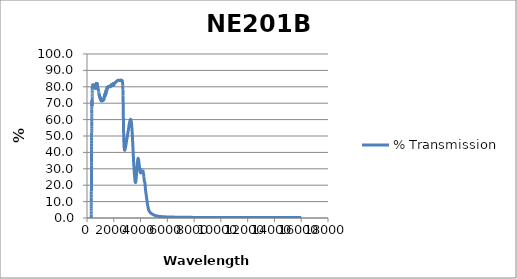
| Category | % Transmission |
|---|---|
| 200.0 | 0.026 |
| 201.0 | 0.026 |
| 202.0 | 0.025 |
| 203.0 | 0.025 |
| 204.0 | 0.025 |
| 205.0 | 0.024 |
| 206.0 | 0.024 |
| 207.0 | 0.024 |
| 208.0 | 0.023 |
| 209.0 | 0.023 |
| 210.0 | 0.023 |
| 211.0 | 0.022 |
| 212.0 | 0.022 |
| 213.0 | 0.022 |
| 214.0 | 0.022 |
| 215.0 | 0.021 |
| 216.0 | 0.021 |
| 217.0 | 0.021 |
| 218.0 | 0.02 |
| 219.0 | 0.02 |
| 220.0 | 0.02 |
| 221.0 | 0.02 |
| 222.0 | 0.02 |
| 223.0 | 0.019 |
| 224.0 | 0.019 |
| 225.0 | 0.019 |
| 226.0 | 0.019 |
| 227.0 | 0.019 |
| 228.0 | 0.018 |
| 229.0 | 0.018 |
| 230.0 | 0.018 |
| 231.0 | 0.018 |
| 232.0 | 0.018 |
| 233.0 | 0.017 |
| 234.0 | 0.017 |
| 235.0 | 0.017 |
| 236.0 | 0.017 |
| 237.0 | 0.017 |
| 238.0 | 0.017 |
| 239.0 | 0.017 |
| 240.0 | 0.016 |
| 241.0 | 0.016 |
| 242.0 | 0.016 |
| 243.0 | 0.016 |
| 244.0 | 0.016 |
| 245.0 | 0.016 |
| 246.0 | 0.015 |
| 247.0 | 0.015 |
| 248.0 | 0.015 |
| 249.0 | 0.015 |
| 250.0 | 0.015 |
| 251.0 | 0.015 |
| 252.0 | 0.015 |
| 253.0 | 0.015 |
| 254.0 | 0.015 |
| 255.0 | 0.015 |
| 256.0 | 0.014 |
| 257.0 | 0.014 |
| 258.0 | 0.014 |
| 259.0 | 0.014 |
| 260.0 | 0.014 |
| 261.0 | 0.014 |
| 262.0 | 0.014 |
| 263.0 | 0.014 |
| 264.0 | 0.014 |
| 265.0 | 0.013 |
| 266.0 | 0.013 |
| 267.0 | 0.013 |
| 268.0 | 0.013 |
| 269.0 | 0.013 |
| 270.0 | 0.013 |
| 271.0 | 0.013 |
| 272.0 | 0.013 |
| 273.0 | 0.013 |
| 274.0 | 0.013 |
| 275.0 | 0.013 |
| 276.0 | 0.013 |
| 277.0 | 0.012 |
| 278.0 | 0.012 |
| 279.0 | 0.012 |
| 280.0 | 0.012 |
| 281.0 | 0.012 |
| 282.0 | 0.012 |
| 283.0 | 0.012 |
| 284.0 | 0.012 |
| 285.0 | 0.012 |
| 286.0 | 0.012 |
| 287.0 | 0.012 |
| 288.0 | 0.012 |
| 289.0 | 0.012 |
| 290.0 | 0.012 |
| 291.0 | 0.012 |
| 292.0 | 0.012 |
| 293.0 | 0.012 |
| 294.0 | 0.011 |
| 295.0 | 0.011 |
| 296.0 | 0.011 |
| 297.0 | 0.011 |
| 298.0 | 0.011 |
| 299.0 | 0.011 |
| 300.0 | 0.012 |
| 301.0 | 0.013 |
| 302.0 | 0.015 |
| 303.0 | 0.018 |
| 304.0 | 0.025 |
| 305.0 | 0.037 |
| 306.0 | 0.057 |
| 307.0 | 0.091 |
| 308.0 | 0.143 |
| 309.0 | 0.223 |
| 310.0 | 0.336 |
| 311.0 | 0.491 |
| 312.0 | 0.7 |
| 313.0 | 0.976 |
| 314.0 | 1.33 |
| 315.0 | 1.773 |
| 316.0 | 2.313 |
| 317.0 | 2.958 |
| 318.0 | 3.737 |
| 319.0 | 4.62 |
| 320.0 | 5.663 |
| 321.0 | 6.838 |
| 322.0 | 8.12 |
| 323.0 | 9.443 |
| 324.0 | 10.932 |
| 325.0 | 12.541 |
| 326.0 | 14.221 |
| 327.0 | 16.132 |
| 328.0 | 18.039 |
| 329.0 | 19.902 |
| 330.0 | 21.915 |
| 331.0 | 23.95 |
| 332.0 | 25.98 |
| 333.0 | 28.074 |
| 334.0 | 30.086 |
| 335.0 | 31.977 |
| 336.0 | 34.009 |
| 337.0 | 36.053 |
| 338.0 | 38.083 |
| 339.0 | 40.099 |
| 340.0 | 41.965 |
| 341.0 | 43.652 |
| 342.0 | 45.519 |
| 343.0 | 47.139 |
| 344.0 | 48.872 |
| 345.0 | 50.507 |
| 346.0 | 52.075 |
| 347.0 | 53.195 |
| 348.0 | 54.621 |
| 349.0 | 55.927 |
| 350.0 | 57.354 |
| 351.0 | 58.929 |
| 352.0 | 60.141 |
| 353.0 | 60.822 |
| 354.0 | 61.939 |
| 355.0 | 62.888 |
| 356.0 | 63.934 |
| 357.0 | 65.194 |
| 358.0 | 66.045 |
| 359.0 | 66.394 |
| 360.0 | 67.285 |
| 361.0 | 67.878 |
| 362.0 | 68.768 |
| 363.0 | 69.699 |
| 364.0 | 70.159 |
| 365.0 | 70.385 |
| 366.0 | 70.913 |
| 367.0 | 71.13 |
| 368.0 | 71.334 |
| 369.0 | 71.805 |
| 370.0 | 71.624 |
| 371.0 | 71.184 |
| 372.0 | 70.802 |
| 373.0 | 70.293 |
| 374.0 | 69.778 |
| 375.0 | 69.516 |
| 376.0 | 68.966 |
| 377.0 | 68.211 |
| 378.0 | 68.582 |
| 379.0 | 68.857 |
| 380.0 | 69.592 |
| 381.0 | 70.03 |
| 382.0 | 70.917 |
| 383.0 | 71.751 |
| 384.0 | 73.28 |
| 385.0 | 74.082 |
| 386.0 | 74.896 |
| 387.0 | 75.22 |
| 388.0 | 75.907 |
| 389.0 | 76.566 |
| 390.0 | 77.515 |
| 391.0 | 77.802 |
| 392.0 | 78.208 |
| 393.0 | 78.088 |
| 394.0 | 78.36 |
| 395.0 | 78.755 |
| 396.0 | 79.539 |
| 397.0 | 79.653 |
| 398.0 | 79.826 |
| 399.0 | 79.42 |
| 400.0 | 79.364 |
| 401.0 | 79.413 |
| 402.0 | 79.918 |
| 403.0 | 79.884 |
| 404.0 | 79.94 |
| 405.0 | 79.471 |
| 406.0 | 79.562 |
| 407.0 | 79.337 |
| 408.0 | 79.728 |
| 409.0 | 79.87 |
| 410.0 | 79.665 |
| 411.0 | 79.064 |
| 412.0 | 79.087 |
| 413.0 | 79.194 |
| 414.0 | 79.439 |
| 415.0 | 79.461 |
| 416.0 | 79.37 |
| 417.0 | 78.981 |
| 418.0 | 79.154 |
| 419.0 | 79.397 |
| 420.0 | 79.717 |
| 421.0 | 79.979 |
| 422.0 | 79.78 |
| 423.0 | 79.433 |
| 424.0 | 79.553 |
| 425.0 | 79.748 |
| 426.0 | 80.093 |
| 427.0 | 80.285 |
| 428.0 | 80.211 |
| 429.0 | 79.819 |
| 430.0 | 79.826 |
| 431.0 | 79.998 |
| 432.0 | 80.255 |
| 433.0 | 80.154 |
| 434.0 | 80.075 |
| 435.0 | 79.835 |
| 436.0 | 79.821 |
| 437.0 | 79.872 |
| 438.0 | 80.129 |
| 439.0 | 80.277 |
| 440.0 | 80.16 |
| 441.0 | 79.695 |
| 442.0 | 79.713 |
| 443.0 | 79.818 |
| 444.0 | 80.124 |
| 445.0 | 80.496 |
| 446.0 | 80.363 |
| 447.0 | 80.042 |
| 448.0 | 80.134 |
| 449.0 | 80.308 |
| 450.0 | 80.776 |
| 451.0 | 81.149 |
| 452.0 | 80.925 |
| 453.0 | 80.6 |
| 454.0 | 80.743 |
| 455.0 | 80.925 |
| 456.0 | 81.27 |
| 457.0 | 81.545 |
| 458.0 | 81.417 |
| 459.0 | 81.044 |
| 460.0 | 81.016 |
| 461.0 | 81.171 |
| 462.0 | 81.552 |
| 463.0 | 81.818 |
| 464.0 | 81.482 |
| 465.0 | 81.108 |
| 466.0 | 81.163 |
| 467.0 | 81.009 |
| 468.0 | 81.349 |
| 469.0 | 81.9 |
| 470.0 | 81.507 |
| 471.0 | 80.947 |
| 472.0 | 80.905 |
| 473.0 | 80.803 |
| 474.0 | 81.149 |
| 475.0 | 81.598 |
| 476.0 | 81.275 |
| 477.0 | 80.704 |
| 478.0 | 80.688 |
| 479.0 | 80.677 |
| 480.0 | 80.92 |
| 481.0 | 81.189 |
| 482.0 | 80.859 |
| 483.0 | 80.433 |
| 484.0 | 80.411 |
| 485.0 | 80.433 |
| 486.0 | 80.695 |
| 487.0 | 80.896 |
| 488.0 | 80.553 |
| 489.0 | 80.321 |
| 490.0 | 80.474 |
| 491.0 | 80.495 |
| 492.0 | 80.49 |
| 493.0 | 80.517 |
| 494.0 | 80.297 |
| 495.0 | 80.097 |
| 496.0 | 80.155 |
| 497.0 | 80.186 |
| 498.0 | 80.431 |
| 499.0 | 80.406 |
| 500.0 | 80.081 |
| 501.0 | 79.905 |
| 502.0 | 79.969 |
| 503.0 | 80.033 |
| 504.0 | 80.29 |
| 505.0 | 80.419 |
| 506.0 | 80.102 |
| 507.0 | 80.019 |
| 508.0 | 80.029 |
| 509.0 | 80.011 |
| 510.0 | 80.181 |
| 511.0 | 80.323 |
| 512.0 | 80.092 |
| 513.0 | 79.913 |
| 514.0 | 79.955 |
| 515.0 | 79.958 |
| 516.0 | 80.252 |
| 517.0 | 80.467 |
| 518.0 | 80.268 |
| 519.0 | 80.287 |
| 520.0 | 80.274 |
| 521.0 | 80.345 |
| 522.0 | 80.497 |
| 523.0 | 80.579 |
| 524.0 | 80.431 |
| 525.0 | 80.399 |
| 526.0 | 80.41 |
| 527.0 | 80.422 |
| 528.0 | 80.557 |
| 529.0 | 80.813 |
| 530.0 | 80.673 |
| 531.0 | 80.617 |
| 532.0 | 80.648 |
| 533.0 | 80.725 |
| 534.0 | 80.824 |
| 535.0 | 80.919 |
| 536.0 | 80.774 |
| 537.0 | 80.654 |
| 538.0 | 80.719 |
| 539.0 | 80.731 |
| 540.0 | 81.062 |
| 541.0 | 81.265 |
| 542.0 | 80.908 |
| 543.0 | 80.884 |
| 544.0 | 80.912 |
| 545.0 | 81.098 |
| 546.0 | 81.179 |
| 547.0 | 81.246 |
| 548.0 | 81.025 |
| 549.0 | 81.068 |
| 550.0 | 81.13 |
| 551.0 | 81.364 |
| 552.0 | 81.174 |
| 553.0 | 80.86 |
| 554.0 | 80.756 |
| 555.0 | 80.817 |
| 556.0 | 80.732 |
| 557.0 | 80.833 |
| 558.0 | 80.892 |
| 559.0 | 81.045 |
| 560.0 | 80.81 |
| 561.0 | 80.868 |
| 562.0 | 80.576 |
| 563.0 | 80.41 |
| 564.0 | 80.388 |
| 565.0 | 80.446 |
| 566.0 | 80.808 |
| 567.0 | 80.606 |
| 568.0 | 80.191 |
| 569.0 | 79.971 |
| 570.0 | 79.911 |
| 571.0 | 80.015 |
| 572.0 | 80.343 |
| 573.0 | 80.085 |
| 574.0 | 79.854 |
| 575.0 | 79.65 |
| 576.0 | 79.535 |
| 577.0 | 79.66 |
| 578.0 | 80.099 |
| 579.0 | 79.854 |
| 580.0 | 79.332 |
| 581.0 | 79.156 |
| 582.0 | 79.091 |
| 583.0 | 79.318 |
| 584.0 | 79.736 |
| 585.0 | 79.409 |
| 586.0 | 79.17 |
| 587.0 | 79.02 |
| 588.0 | 78.875 |
| 589.0 | 79.043 |
| 590.0 | 79.477 |
| 591.0 | 79.145 |
| 592.0 | 78.969 |
| 593.0 | 78.845 |
| 594.0 | 78.784 |
| 595.0 | 78.99 |
| 596.0 | 79.444 |
| 597.0 | 79.176 |
| 598.0 | 78.933 |
| 599.0 | 79.089 |
| 600.0 | 79.115 |
| 601.0 | 79.083 |
| 602.0 | 79.346 |
| 603.0 | 79.238 |
| 604.0 | 78.898 |
| 605.0 | 79.078 |
| 606.0 | 79.02 |
| 607.0 | 79.05 |
| 608.0 | 79.492 |
| 609.0 | 79.356 |
| 610.0 | 79.012 |
| 611.0 | 79.05 |
| 612.0 | 78.963 |
| 613.0 | 79.106 |
| 614.0 | 79.411 |
| 615.0 | 79.319 |
| 616.0 | 79.171 |
| 617.0 | 79.286 |
| 618.0 | 79.147 |
| 619.0 | 79.33 |
| 620.0 | 79.618 |
| 621.0 | 79.116 |
| 622.0 | 79.155 |
| 623.0 | 79.39 |
| 624.0 | 79.281 |
| 625.0 | 79.443 |
| 626.0 | 79.819 |
| 627.0 | 79.162 |
| 628.0 | 78.931 |
| 629.0 | 79.228 |
| 630.0 | 79.012 |
| 631.0 | 79.287 |
| 632.0 | 79.456 |
| 633.0 | 78.993 |
| 634.0 | 78.865 |
| 635.0 | 79.067 |
| 636.0 | 78.86 |
| 637.0 | 79.157 |
| 638.0 | 79.189 |
| 639.0 | 78.936 |
| 640.0 | 78.738 |
| 641.0 | 78.897 |
| 642.0 | 78.802 |
| 643.0 | 78.997 |
| 644.0 | 78.946 |
| 645.0 | 78.68 |
| 646.0 | 78.529 |
| 647.0 | 78.792 |
| 648.0 | 78.654 |
| 649.0 | 78.756 |
| 650.0 | 78.869 |
| 651.0 | 78.629 |
| 652.0 | 78.516 |
| 653.0 | 78.771 |
| 654.0 | 78.592 |
| 655.0 | 79.013 |
| 656.0 | 79.072 |
| 657.0 | 78.566 |
| 658.0 | 78.523 |
| 659.0 | 78.842 |
| 660.0 | 78.631 |
| 661.0 | 78.983 |
| 662.0 | 79.152 |
| 663.0 | 78.588 |
| 664.0 | 78.579 |
| 665.0 | 79.125 |
| 666.0 | 78.768 |
| 667.0 | 79.223 |
| 668.0 | 79.64 |
| 669.0 | 79.152 |
| 670.0 | 79.051 |
| 671.0 | 79.282 |
| 672.0 | 79.528 |
| 673.0 | 79.718 |
| 674.0 | 79.535 |
| 675.0 | 79.51 |
| 676.0 | 79.453 |
| 677.0 | 79.859 |
| 678.0 | 79.873 |
| 679.0 | 80.26 |
| 680.0 | 80.122 |
| 681.0 | 80.145 |
| 682.0 | 80.275 |
| 683.0 | 80.656 |
| 684.0 | 80.76 |
| 685.0 | 80.726 |
| 686.0 | 80.991 |
| 687.0 | 80.604 |
| 688.0 | 80.623 |
| 689.0 | 81.323 |
| 690.0 | 80.957 |
| 691.0 | 80.779 |
| 692.0 | 81.43 |
| 693.0 | 81.552 |
| 694.0 | 81.344 |
| 695.0 | 81.715 |
| 696.0 | 81.23 |
| 697.0 | 81.818 |
| 698.0 | 82.252 |
| 699.0 | 81.483 |
| 700.0 | 81.471 |
| 701.0 | 82.19 |
| 702.0 | 81.725 |
| 703.0 | 81.978 |
| 704.0 | 82.477 |
| 705.0 | 81.84 |
| 706.0 | 81.882 |
| 707.0 | 82.13 |
| 708.0 | 81.73 |
| 709.0 | 82.167 |
| 710.0 | 82.674 |
| 711.0 | 81.821 |
| 712.0 | 82.16 |
| 713.0 | 82.368 |
| 714.0 | 82.073 |
| 715.0 | 82.453 |
| 716.0 | 82.732 |
| 717.0 | 81.937 |
| 718.0 | 82.129 |
| 719.0 | 82.244 |
| 720.0 | 81.939 |
| 721.0 | 82.341 |
| 722.0 | 82.531 |
| 723.0 | 81.878 |
| 724.0 | 81.973 |
| 725.0 | 82.137 |
| 726.0 | 82.039 |
| 727.0 | 82.236 |
| 728.0 | 82.433 |
| 729.0 | 81.866 |
| 730.0 | 81.933 |
| 731.0 | 81.927 |
| 732.0 | 81.578 |
| 733.0 | 82.069 |
| 734.0 | 82.356 |
| 735.0 | 81.627 |
| 736.0 | 81.81 |
| 737.0 | 81.914 |
| 738.0 | 81.752 |
| 739.0 | 81.915 |
| 740.0 | 82.215 |
| 741.0 | 81.81 |
| 742.0 | 81.666 |
| 743.0 | 81.676 |
| 744.0 | 81.823 |
| 745.0 | 81.692 |
| 746.0 | 81.997 |
| 747.0 | 81.613 |
| 748.0 | 81.328 |
| 749.0 | 81.433 |
| 750.0 | 81.8 |
| 751.0 | 81.759 |
| 752.0 | 81.759 |
| 753.0 | 81.748 |
| 754.0 | 81.687 |
| 755.0 | 81.656 |
| 756.0 | 81.626 |
| 757.0 | 81.575 |
| 758.0 | 81.555 |
| 759.0 | 81.539 |
| 760.0 | 81.475 |
| 761.0 | 81.428 |
| 762.0 | 81.396 |
| 763.0 | 81.358 |
| 764.0 | 81.326 |
| 765.0 | 81.309 |
| 766.0 | 81.246 |
| 767.0 | 81.196 |
| 768.0 | 81.165 |
| 769.0 | 81.117 |
| 770.0 | 81.106 |
| 771.0 | 81.08 |
| 772.0 | 81.013 |
| 773.0 | 80.971 |
| 774.0 | 80.948 |
| 775.0 | 80.904 |
| 776.0 | 80.89 |
| 777.0 | 80.863 |
| 778.0 | 80.797 |
| 779.0 | 80.755 |
| 780.0 | 80.722 |
| 781.0 | 80.672 |
| 782.0 | 80.65 |
| 783.0 | 80.617 |
| 784.0 | 80.549 |
| 785.0 | 80.5 |
| 786.0 | 80.467 |
| 787.0 | 80.423 |
| 788.0 | 80.404 |
| 789.0 | 80.37 |
| 790.0 | 80.301 |
| 791.0 | 80.256 |
| 792.0 | 80.23 |
| 793.0 | 80.179 |
| 794.0 | 80.164 |
| 795.0 | 80.13 |
| 796.0 | 80.058 |
| 797.0 | 80.007 |
| 798.0 | 79.972 |
| 799.0 | 79.927 |
| 800.0 | 79.908 |
| 801.0 | 79.871 |
| 802.0 | 79.813 |
| 803.0 | 79.771 |
| 804.0 | 79.747 |
| 805.0 | 79.72 |
| 806.0 | 79.703 |
| 807.0 | 79.67 |
| 808.0 | 79.61 |
| 809.0 | 79.581 |
| 810.0 | 79.553 |
| 811.0 | 79.497 |
| 812.0 | 79.458 |
| 813.0 | 79.393 |
| 814.0 | 79.334 |
| 815.0 | 79.327 |
| 816.0 | 79.325 |
| 817.0 | 79.286 |
| 818.0 | 79.247 |
| 819.0 | 79.196 |
| 820.0 | 79.135 |
| 821.0 | 79.099 |
| 822.0 | 79.084 |
| 823.0 | 79.044 |
| 824.0 | 78.989 |
| 825.0 | 78.93 |
| 826.0 | 78.873 |
| 827.0 | 78.85 |
| 828.0 | 78.822 |
| 829.0 | 78.765 |
| 830.0 | 78.728 |
| 831.0 | 78.694 |
| 832.0 | 78.658 |
| 833.0 | 78.639 |
| 834.0 | 78.602 |
| 835.0 | 78.542 |
| 836.0 | 78.504 |
| 837.0 | 78.476 |
| 838.0 | 78.438 |
| 839.0 | 78.413 |
| 840.0 | 78.381 |
| 841.0 | 78.317 |
| 842.0 | 78.28 |
| 843.0 | 78.252 |
| 844.0 | 78.216 |
| 845.0 | 78.189 |
| 846.0 | 78.178 |
| 847.0 | 78.161 |
| 848.0 | 78.144 |
| 849.0 | 78.116 |
| 850.0 | 78.08 |
| 851.0 | 78.064 |
| 852.0 | 78.026 |
| 853.0 | 77.959 |
| 854.0 | 77.91 |
| 855.0 | 77.889 |
| 856.0 | 77.87 |
| 857.0 | 77.844 |
| 858.0 | 77.814 |
| 859.0 | 77.771 |
| 860.0 | 77.733 |
| 861.0 | 77.722 |
| 862.0 | 77.725 |
| 863.0 | 77.677 |
| 864.0 | 77.586 |
| 865.0 | 77.48 |
| 866.0 | 77.371 |
| 867.0 | 77.295 |
| 868.0 | 77.231 |
| 869.0 | 77.196 |
| 870.0 | 77.161 |
| 871.0 | 77.059 |
| 872.0 | 76.855 |
| 873.0 | 76.658 |
| 874.0 | 76.55 |
| 875.0 | 76.556 |
| 876.0 | 76.629 |
| 877.0 | 76.586 |
| 878.0 | 76.429 |
| 879.0 | 76.293 |
| 880.0 | 76.231 |
| 881.0 | 76.111 |
| 882.0 | 76.018 |
| 883.0 | 76.03 |
| 884.0 | 75.99 |
| 885.0 | 75.929 |
| 886.0 | 75.89 |
| 887.0 | 75.877 |
| 888.0 | 75.835 |
| 889.0 | 75.705 |
| 890.0 | 75.571 |
| 891.0 | 75.557 |
| 892.0 | 75.599 |
| 893.0 | 75.601 |
| 894.0 | 75.539 |
| 895.0 | 75.513 |
| 896.0 | 75.566 |
| 897.0 | 75.676 |
| 898.0 | 75.72 |
| 899.0 | 75.629 |
| 900.0 | 75.584 |
| 901.0 | 75.567 |
| 902.0 | 75.505 |
| 903.0 | 75.507 |
| 904.0 | 75.522 |
| 905.0 | 75.465 |
| 906.0 | 75.38 |
| 907.0 | 75.268 |
| 908.0 | 75.127 |
| 909.0 | 75.139 |
| 910.0 | 75.33 |
| 911.0 | 75.533 |
| 912.0 | 75.592 |
| 913.0 | 75.405 |
| 914.0 | 75.067 |
| 915.0 | 74.862 |
| 916.0 | 74.839 |
| 917.0 | 74.858 |
| 918.0 | 74.937 |
| 919.0 | 74.969 |
| 920.0 | 74.829 |
| 921.0 | 74.601 |
| 922.0 | 74.519 |
| 923.0 | 74.623 |
| 924.0 | 74.746 |
| 925.0 | 74.737 |
| 926.0 | 74.592 |
| 927.0 | 74.655 |
| 928.0 | 74.83 |
| 929.0 | 74.733 |
| 930.0 | 74.396 |
| 931.0 | 74.221 |
| 932.0 | 74.435 |
| 933.0 | 74.694 |
| 934.0 | 74.72 |
| 935.0 | 74.584 |
| 936.0 | 74.379 |
| 937.0 | 74.242 |
| 938.0 | 74.325 |
| 939.0 | 74.459 |
| 940.0 | 74.454 |
| 941.0 | 74.367 |
| 942.0 | 74.231 |
| 943.0 | 74.144 |
| 944.0 | 74.136 |
| 945.0 | 74.218 |
| 946.0 | 74.086 |
| 947.0 | 73.856 |
| 948.0 | 73.977 |
| 949.0 | 74.296 |
| 950.0 | 74.297 |
| 951.0 | 73.941 |
| 952.0 | 73.715 |
| 953.0 | 73.789 |
| 954.0 | 73.8 |
| 955.0 | 73.817 |
| 956.0 | 73.717 |
| 957.0 | 73.504 |
| 958.0 | 73.559 |
| 959.0 | 73.75 |
| 960.0 | 73.792 |
| 961.0 | 73.688 |
| 962.0 | 73.566 |
| 963.0 | 73.601 |
| 964.0 | 73.632 |
| 965.0 | 73.74 |
| 966.0 | 73.835 |
| 967.0 | 73.559 |
| 968.0 | 73.197 |
| 969.0 | 73.245 |
| 970.0 | 73.461 |
| 971.0 | 73.436 |
| 972.0 | 73.227 |
| 973.0 | 73.223 |
| 974.0 | 73.209 |
| 975.0 | 73.32 |
| 976.0 | 73.442 |
| 977.0 | 73.374 |
| 978.0 | 73.267 |
| 979.0 | 73.156 |
| 980.0 | 73.157 |
| 981.0 | 73.072 |
| 982.0 | 72.989 |
| 983.0 | 73.016 |
| 984.0 | 73.036 |
| 985.0 | 72.885 |
| 986.0 | 72.927 |
| 987.0 | 73.036 |
| 988.0 | 72.927 |
| 989.0 | 72.783 |
| 990.0 | 72.817 |
| 991.0 | 72.838 |
| 992.0 | 72.791 |
| 993.0 | 72.976 |
| 994.0 | 72.946 |
| 995.0 | 72.755 |
| 996.0 | 72.55 |
| 997.0 | 72.556 |
| 998.0 | 72.747 |
| 999.0 | 72.757 |
| 1000.0 | 72.792 |
| 1001.0 | 72.713 |
| 1002.0 | 72.708 |
| 1003.0 | 72.72 |
| 1004.0 | 72.746 |
| 1005.0 | 72.671 |
| 1006.0 | 72.589 |
| 1007.0 | 72.72 |
| 1008.0 | 72.87 |
| 1009.0 | 72.824 |
| 1010.0 | 72.712 |
| 1011.0 | 72.684 |
| 1012.0 | 72.677 |
| 1013.0 | 72.807 |
| 1014.0 | 72.836 |
| 1015.0 | 72.881 |
| 1016.0 | 72.745 |
| 1017.0 | 72.526 |
| 1018.0 | 72.611 |
| 1019.0 | 72.732 |
| 1020.0 | 72.699 |
| 1021.0 | 72.529 |
| 1022.0 | 72.36 |
| 1023.0 | 72.223 |
| 1024.0 | 72.284 |
| 1025.0 | 72.439 |
| 1026.0 | 72.342 |
| 1027.0 | 72.121 |
| 1028.0 | 72.051 |
| 1029.0 | 72.223 |
| 1030.0 | 72.322 |
| 1031.0 | 72.224 |
| 1032.0 | 72.072 |
| 1033.0 | 71.955 |
| 1034.0 | 71.897 |
| 1035.0 | 72.043 |
| 1036.0 | 72.22 |
| 1037.0 | 72.16 |
| 1038.0 | 72.042 |
| 1039.0 | 71.985 |
| 1040.0 | 71.891 |
| 1041.0 | 71.875 |
| 1042.0 | 72.109 |
| 1043.0 | 72.197 |
| 1044.0 | 72.151 |
| 1045.0 | 72.098 |
| 1046.0 | 72.049 |
| 1047.0 | 71.974 |
| 1048.0 | 71.951 |
| 1049.0 | 71.935 |
| 1050.0 | 71.933 |
| 1051.0 | 71.938 |
| 1052.0 | 72.006 |
| 1053.0 | 71.963 |
| 1054.0 | 71.738 |
| 1055.0 | 71.47 |
| 1056.0 | 71.45 |
| 1057.0 | 71.534 |
| 1058.0 | 71.642 |
| 1059.0 | 71.683 |
| 1060.0 | 71.703 |
| 1061.0 | 71.5 |
| 1062.0 | 71.427 |
| 1063.0 | 71.418 |
| 1064.0 | 71.46 |
| 1065.0 | 71.617 |
| 1066.0 | 71.773 |
| 1067.0 | 71.827 |
| 1068.0 | 71.752 |
| 1069.0 | 71.584 |
| 1070.0 | 71.342 |
| 1071.0 | 71.223 |
| 1072.0 | 71.375 |
| 1073.0 | 71.579 |
| 1074.0 | 71.76 |
| 1075.0 | 71.727 |
| 1076.0 | 71.688 |
| 1077.0 | 71.62 |
| 1078.0 | 71.615 |
| 1079.0 | 71.754 |
| 1080.0 | 71.936 |
| 1081.0 | 71.823 |
| 1082.0 | 71.737 |
| 1083.0 | 71.689 |
| 1084.0 | 71.606 |
| 1085.0 | 71.564 |
| 1086.0 | 71.462 |
| 1087.0 | 71.449 |
| 1088.0 | 71.488 |
| 1089.0 | 71.72 |
| 1090.0 | 71.847 |
| 1091.0 | 71.791 |
| 1092.0 | 71.749 |
| 1093.0 | 71.659 |
| 1094.0 | 71.605 |
| 1095.0 | 71.533 |
| 1096.0 | 71.602 |
| 1097.0 | 71.727 |
| 1098.0 | 71.646 |
| 1099.0 | 71.531 |
| 1100.0 | 71.523 |
| 1101.0 | 71.472 |
| 1102.0 | 71.418 |
| 1103.0 | 71.479 |
| 1104.0 | 71.539 |
| 1105.0 | 71.561 |
| 1106.0 | 71.557 |
| 1107.0 | 71.582 |
| 1108.0 | 71.491 |
| 1109.0 | 71.476 |
| 1110.0 | 71.448 |
| 1111.0 | 71.294 |
| 1112.0 | 71.397 |
| 1113.0 | 71.412 |
| 1114.0 | 71.406 |
| 1115.0 | 71.372 |
| 1116.0 | 71.351 |
| 1117.0 | 71.359 |
| 1118.0 | 71.399 |
| 1119.0 | 71.432 |
| 1120.0 | 71.474 |
| 1121.0 | 71.578 |
| 1122.0 | 71.551 |
| 1123.0 | 71.492 |
| 1124.0 | 71.471 |
| 1125.0 | 71.417 |
| 1126.0 | 71.341 |
| 1127.0 | 71.452 |
| 1128.0 | 71.524 |
| 1129.0 | 71.595 |
| 1130.0 | 71.737 |
| 1131.0 | 71.597 |
| 1132.0 | 71.447 |
| 1133.0 | 71.407 |
| 1134.0 | 71.411 |
| 1135.0 | 71.524 |
| 1136.0 | 71.528 |
| 1137.0 | 71.46 |
| 1138.0 | 71.442 |
| 1139.0 | 71.454 |
| 1140.0 | 71.398 |
| 1141.0 | 71.359 |
| 1142.0 | 71.318 |
| 1143.0 | 71.228 |
| 1144.0 | 71.154 |
| 1145.0 | 71.138 |
| 1146.0 | 71.094 |
| 1147.0 | 71.214 |
| 1148.0 | 71.21 |
| 1149.0 | 71.279 |
| 1150.0 | 71.379 |
| 1151.0 | 71.479 |
| 1152.0 | 71.539 |
| 1153.0 | 71.575 |
| 1154.0 | 71.475 |
| 1155.0 | 71.446 |
| 1156.0 | 71.442 |
| 1157.0 | 71.413 |
| 1158.0 | 71.336 |
| 1159.0 | 71.267 |
| 1160.0 | 71.299 |
| 1161.0 | 71.357 |
| 1162.0 | 71.459 |
| 1163.0 | 71.607 |
| 1164.0 | 71.734 |
| 1165.0 | 71.697 |
| 1166.0 | 71.527 |
| 1167.0 | 71.55 |
| 1168.0 | 71.548 |
| 1169.0 | 71.603 |
| 1170.0 | 71.709 |
| 1171.0 | 71.787 |
| 1172.0 | 71.814 |
| 1173.0 | 71.778 |
| 1174.0 | 71.632 |
| 1175.0 | 71.506 |
| 1176.0 | 71.389 |
| 1177.0 | 71.353 |
| 1178.0 | 71.471 |
| 1179.0 | 71.511 |
| 1180.0 | 71.504 |
| 1181.0 | 71.492 |
| 1182.0 | 71.508 |
| 1183.0 | 71.554 |
| 1184.0 | 71.645 |
| 1185.0 | 71.741 |
| 1186.0 | 71.768 |
| 1187.0 | 71.776 |
| 1188.0 | 71.801 |
| 1189.0 | 71.89 |
| 1190.0 | 71.922 |
| 1191.0 | 71.863 |
| 1192.0 | 71.87 |
| 1193.0 | 72.027 |
| 1194.0 | 72.176 |
| 1195.0 | 72.284 |
| 1196.0 | 72.317 |
| 1197.0 | 72.26 |
| 1198.0 | 72.387 |
| 1199.0 | 72.496 |
| 1200.0 | 72.47 |
| 1201.0 | 72.475 |
| 1202.0 | 72.487 |
| 1203.0 | 72.38 |
| 1204.0 | 72.391 |
| 1205.0 | 72.571 |
| 1206.0 | 72.689 |
| 1207.0 | 72.627 |
| 1208.0 | 72.493 |
| 1209.0 | 72.37 |
| 1210.0 | 72.344 |
| 1211.0 | 72.344 |
| 1212.0 | 72.353 |
| 1213.0 | 72.33 |
| 1214.0 | 72.386 |
| 1215.0 | 72.454 |
| 1216.0 | 72.415 |
| 1217.0 | 72.206 |
| 1218.0 | 72.122 |
| 1219.0 | 72.301 |
| 1220.0 | 72.34 |
| 1221.0 | 72.242 |
| 1222.0 | 72.246 |
| 1223.0 | 72.147 |
| 1224.0 | 71.967 |
| 1225.0 | 71.873 |
| 1226.0 | 71.855 |
| 1227.0 | 71.82 |
| 1228.0 | 71.834 |
| 1229.0 | 71.862 |
| 1230.0 | 71.871 |
| 1231.0 | 71.832 |
| 1232.0 | 71.84 |
| 1233.0 | 71.855 |
| 1234.0 | 71.969 |
| 1235.0 | 72.24 |
| 1236.0 | 72.424 |
| 1237.0 | 72.441 |
| 1238.0 | 72.315 |
| 1239.0 | 72.339 |
| 1240.0 | 72.567 |
| 1241.0 | 72.786 |
| 1242.0 | 73.001 |
| 1243.0 | 73.069 |
| 1244.0 | 73.006 |
| 1245.0 | 72.999 |
| 1246.0 | 73.024 |
| 1247.0 | 73.041 |
| 1248.0 | 73.049 |
| 1249.0 | 73.071 |
| 1250.0 | 73.108 |
| 1251.0 | 73.124 |
| 1252.0 | 73.083 |
| 1253.0 | 72.945 |
| 1254.0 | 72.725 |
| 1255.0 | 72.59 |
| 1256.0 | 72.535 |
| 1257.0 | 72.465 |
| 1258.0 | 72.359 |
| 1259.0 | 72.3 |
| 1260.0 | 72.388 |
| 1261.0 | 72.466 |
| 1262.0 | 72.43 |
| 1263.0 | 72.332 |
| 1264.0 | 72.269 |
| 1265.0 | 72.28 |
| 1266.0 | 72.288 |
| 1267.0 | 72.316 |
| 1268.0 | 72.368 |
| 1269.0 | 72.421 |
| 1270.0 | 72.509 |
| 1271.0 | 72.663 |
| 1272.0 | 72.785 |
| 1273.0 | 72.836 |
| 1274.0 | 72.928 |
| 1275.0 | 73.081 |
| 1276.0 | 73.262 |
| 1277.0 | 73.407 |
| 1278.0 | 73.432 |
| 1279.0 | 73.322 |
| 1280.0 | 73.184 |
| 1281.0 | 73.122 |
| 1282.0 | 73.178 |
| 1283.0 | 73.348 |
| 1284.0 | 73.558 |
| 1285.0 | 73.746 |
| 1286.0 | 73.951 |
| 1287.0 | 74.151 |
| 1288.0 | 74.292 |
| 1289.0 | 74.335 |
| 1290.0 | 74.273 |
| 1291.0 | 74.218 |
| 1292.0 | 74.204 |
| 1293.0 | 74.136 |
| 1294.0 | 73.97 |
| 1295.0 | 73.824 |
| 1296.0 | 73.826 |
| 1297.0 | 73.896 |
| 1298.0 | 73.97 |
| 1299.0 | 74.096 |
| 1300.0 | 74.284 |
| 1301.0 | 74.372 |
| 1302.0 | 74.267 |
| 1303.0 | 74.064 |
| 1304.0 | 73.872 |
| 1305.0 | 73.712 |
| 1306.0 | 73.701 |
| 1307.0 | 73.828 |
| 1308.0 | 73.93 |
| 1309.0 | 73.981 |
| 1310.0 | 73.982 |
| 1311.0 | 73.976 |
| 1312.0 | 74.101 |
| 1313.0 | 74.364 |
| 1314.0 | 74.597 |
| 1315.0 | 74.683 |
| 1316.0 | 74.697 |
| 1317.0 | 74.619 |
| 1318.0 | 74.496 |
| 1319.0 | 74.425 |
| 1320.0 | 74.505 |
| 1321.0 | 74.661 |
| 1322.0 | 74.805 |
| 1323.0 | 74.907 |
| 1324.0 | 74.951 |
| 1325.0 | 74.861 |
| 1326.0 | 74.744 |
| 1327.0 | 74.756 |
| 1328.0 | 74.848 |
| 1329.0 | 74.896 |
| 1330.0 | 74.862 |
| 1331.0 | 74.702 |
| 1332.0 | 74.483 |
| 1333.0 | 74.229 |
| 1334.0 | 74.005 |
| 1335.0 | 73.888 |
| 1336.0 | 73.911 |
| 1337.0 | 73.96 |
| 1338.0 | 74.04 |
| 1339.0 | 74.19 |
| 1340.0 | 74.395 |
| 1341.0 | 74.664 |
| 1342.0 | 74.948 |
| 1343.0 | 75.006 |
| 1344.0 | 74.928 |
| 1345.0 | 74.793 |
| 1346.0 | 74.853 |
| 1347.0 | 75.086 |
| 1348.0 | 75.431 |
| 1349.0 | 75.674 |
| 1350.0 | 75.918 |
| 1351.0 | 76.089 |
| 1352.0 | 76.08 |
| 1353.0 | 75.995 |
| 1354.0 | 75.896 |
| 1355.0 | 76.012 |
| 1356.0 | 76.186 |
| 1357.0 | 76.214 |
| 1358.0 | 75.942 |
| 1359.0 | 75.398 |
| 1360.0 | 74.872 |
| 1361.0 | 74.724 |
| 1362.0 | 74.931 |
| 1363.0 | 75.172 |
| 1364.0 | 75.486 |
| 1365.0 | 75.538 |
| 1366.0 | 75.056 |
| 1367.0 | 74.632 |
| 1368.0 | 74.626 |
| 1369.0 | 74.631 |
| 1370.0 | 74.747 |
| 1371.0 | 75.278 |
| 1372.0 | 75.736 |
| 1373.0 | 75.806 |
| 1374.0 | 75.628 |
| 1375.0 | 75.618 |
| 1376.0 | 75.852 |
| 1377.0 | 76.343 |
| 1378.0 | 76.737 |
| 1379.0 | 76.658 |
| 1380.0 | 76.179 |
| 1381.0 | 75.77 |
| 1382.0 | 75.693 |
| 1383.0 | 75.674 |
| 1384.0 | 75.647 |
| 1385.0 | 75.978 |
| 1386.0 | 76.143 |
| 1387.0 | 76.152 |
| 1388.0 | 76.454 |
| 1389.0 | 76.605 |
| 1390.0 | 76.256 |
| 1391.0 | 76.067 |
| 1392.0 | 76.234 |
| 1393.0 | 76.038 |
| 1394.0 | 75.595 |
| 1395.0 | 75.499 |
| 1396.0 | 75.568 |
| 1397.0 | 75.44 |
| 1398.0 | 75.413 |
| 1399.0 | 75.724 |
| 1400.0 | 76.266 |
| 1401.0 | 76.61 |
| 1402.0 | 76.639 |
| 1403.0 | 76.521 |
| 1404.0 | 76.499 |
| 1405.0 | 76.559 |
| 1406.0 | 76.43 |
| 1407.0 | 75.958 |
| 1408.0 | 75.653 |
| 1409.0 | 75.874 |
| 1410.0 | 76.02 |
| 1411.0 | 76.014 |
| 1412.0 | 76.308 |
| 1413.0 | 76.723 |
| 1414.0 | 76.784 |
| 1415.0 | 76.564 |
| 1416.0 | 76.767 |
| 1417.0 | 77.242 |
| 1418.0 | 77.55 |
| 1419.0 | 77.473 |
| 1420.0 | 77.156 |
| 1421.0 | 76.914 |
| 1422.0 | 76.863 |
| 1423.0 | 76.815 |
| 1424.0 | 76.792 |
| 1425.0 | 76.849 |
| 1426.0 | 77.081 |
| 1427.0 | 77.231 |
| 1428.0 | 77.201 |
| 1429.0 | 77.121 |
| 1430.0 | 77.24 |
| 1431.0 | 77.452 |
| 1432.0 | 77.562 |
| 1433.0 | 77.649 |
| 1434.0 | 77.795 |
| 1435.0 | 77.734 |
| 1436.0 | 77.638 |
| 1437.0 | 77.415 |
| 1438.0 | 77.168 |
| 1439.0 | 77.155 |
| 1440.0 | 77.542 |
| 1441.0 | 77.967 |
| 1442.0 | 78.211 |
| 1443.0 | 78.204 |
| 1444.0 | 78.257 |
| 1445.0 | 78.216 |
| 1446.0 | 77.975 |
| 1447.0 | 77.641 |
| 1448.0 | 77.603 |
| 1449.0 | 77.705 |
| 1450.0 | 77.789 |
| 1451.0 | 77.843 |
| 1452.0 | 77.783 |
| 1453.0 | 77.53 |
| 1454.0 | 77.534 |
| 1455.0 | 77.638 |
| 1456.0 | 77.735 |
| 1457.0 | 77.838 |
| 1458.0 | 77.964 |
| 1459.0 | 77.932 |
| 1460.0 | 77.766 |
| 1461.0 | 77.673 |
| 1462.0 | 77.828 |
| 1463.0 | 77.995 |
| 1464.0 | 78.032 |
| 1465.0 | 78.038 |
| 1466.0 | 78.119 |
| 1467.0 | 78.154 |
| 1468.0 | 77.915 |
| 1469.0 | 77.695 |
| 1470.0 | 77.552 |
| 1471.0 | 77.462 |
| 1472.0 | 77.521 |
| 1473.0 | 77.589 |
| 1474.0 | 77.566 |
| 1475.0 | 77.589 |
| 1476.0 | 77.604 |
| 1477.0 | 77.601 |
| 1478.0 | 77.514 |
| 1479.0 | 77.519 |
| 1480.0 | 77.596 |
| 1481.0 | 77.669 |
| 1482.0 | 77.625 |
| 1483.0 | 77.705 |
| 1484.0 | 77.999 |
| 1485.0 | 78.345 |
| 1486.0 | 78.562 |
| 1487.0 | 78.82 |
| 1488.0 | 79.015 |
| 1489.0 | 79.196 |
| 1490.0 | 79.335 |
| 1491.0 | 79.488 |
| 1492.0 | 79.484 |
| 1493.0 | 79.516 |
| 1494.0 | 79.581 |
| 1495.0 | 79.546 |
| 1496.0 | 79.433 |
| 1497.0 | 79.286 |
| 1498.0 | 79.267 |
| 1499.0 | 79.41 |
| 1500.0 | 79.492 |
| 1501.0 | 79.507 |
| 1502.0 | 79.486 |
| 1503.0 | 79.442 |
| 1504.0 | 79.299 |
| 1505.0 | 79.121 |
| 1506.0 | 79.027 |
| 1507.0 | 79.085 |
| 1508.0 | 78.879 |
| 1509.0 | 78.693 |
| 1510.0 | 78.584 |
| 1511.0 | 78.623 |
| 1512.0 | 78.662 |
| 1513.0 | 78.755 |
| 1514.0 | 78.943 |
| 1515.0 | 79.03 |
| 1516.0 | 79.105 |
| 1517.0 | 79.058 |
| 1518.0 | 78.961 |
| 1519.0 | 79.043 |
| 1520.0 | 79.197 |
| 1521.0 | 79.182 |
| 1522.0 | 79.192 |
| 1523.0 | 79.251 |
| 1524.0 | 79.27 |
| 1525.0 | 79.184 |
| 1526.0 | 79.062 |
| 1527.0 | 79.3 |
| 1528.0 | 79.412 |
| 1529.0 | 79.43 |
| 1530.0 | 79.48 |
| 1531.0 | 79.512 |
| 1532.0 | 79.423 |
| 1533.0 | 79.352 |
| 1534.0 | 79.384 |
| 1535.0 | 79.393 |
| 1536.0 | 79.46 |
| 1537.0 | 79.37 |
| 1538.0 | 79.183 |
| 1539.0 | 79.201 |
| 1540.0 | 79.406 |
| 1541.0 | 79.402 |
| 1542.0 | 79.347 |
| 1543.0 | 79.411 |
| 1544.0 | 79.486 |
| 1545.0 | 79.456 |
| 1546.0 | 79.307 |
| 1547.0 | 79.246 |
| 1548.0 | 79.276 |
| 1549.0 | 79.384 |
| 1550.0 | 79.508 |
| 1551.0 | 79.522 |
| 1552.0 | 79.479 |
| 1553.0 | 79.464 |
| 1554.0 | 79.5 |
| 1555.0 | 79.45 |
| 1556.0 | 79.446 |
| 1557.0 | 79.515 |
| 1558.0 | 79.6 |
| 1559.0 | 79.594 |
| 1560.0 | 79.687 |
| 1561.0 | 79.782 |
| 1562.0 | 79.782 |
| 1563.0 | 79.804 |
| 1564.0 | 79.865 |
| 1565.0 | 79.918 |
| 1566.0 | 79.886 |
| 1567.0 | 79.844 |
| 1568.0 | 79.724 |
| 1569.0 | 79.662 |
| 1570.0 | 79.785 |
| 1571.0 | 79.908 |
| 1572.0 | 79.846 |
| 1573.0 | 79.805 |
| 1574.0 | 79.79 |
| 1575.0 | 79.803 |
| 1576.0 | 79.854 |
| 1577.0 | 79.859 |
| 1578.0 | 79.817 |
| 1579.0 | 79.746 |
| 1580.0 | 79.753 |
| 1581.0 | 79.782 |
| 1582.0 | 79.774 |
| 1583.0 | 79.696 |
| 1584.0 | 79.647 |
| 1585.0 | 79.808 |
| 1586.0 | 79.974 |
| 1587.0 | 80.026 |
| 1588.0 | 80.007 |
| 1589.0 | 79.925 |
| 1590.0 | 79.884 |
| 1591.0 | 80.022 |
| 1592.0 | 80.104 |
| 1593.0 | 80.206 |
| 1594.0 | 80.247 |
| 1595.0 | 80.175 |
| 1596.0 | 80.002 |
| 1597.0 | 79.983 |
| 1598.0 | 80.1 |
| 1599.0 | 80.207 |
| 1600.0 | 80.289 |
| 1601.0 | 80.362 |
| 1602.0 | 80.48 |
| 1603.0 | 80.541 |
| 1604.0 | 80.376 |
| 1605.0 | 80.096 |
| 1606.0 | 80.009 |
| 1607.0 | 80.01 |
| 1608.0 | 79.969 |
| 1609.0 | 79.936 |
| 1610.0 | 79.947 |
| 1611.0 | 79.992 |
| 1612.0 | 80.014 |
| 1613.0 | 80.043 |
| 1614.0 | 80.052 |
| 1615.0 | 80.045 |
| 1616.0 | 79.997 |
| 1617.0 | 79.974 |
| 1618.0 | 79.948 |
| 1619.0 | 79.948 |
| 1620.0 | 80 |
| 1621.0 | 80.034 |
| 1622.0 | 80.092 |
| 1623.0 | 80.222 |
| 1624.0 | 80.287 |
| 1625.0 | 80.152 |
| 1626.0 | 80.088 |
| 1627.0 | 80.2 |
| 1628.0 | 80.314 |
| 1629.0 | 80.379 |
| 1630.0 | 80.439 |
| 1631.0 | 80.534 |
| 1632.0 | 80.594 |
| 1633.0 | 80.496 |
| 1634.0 | 80.328 |
| 1635.0 | 80.326 |
| 1636.0 | 80.459 |
| 1637.0 | 80.545 |
| 1638.0 | 80.568 |
| 1639.0 | 80.404 |
| 1640.0 | 80.103 |
| 1641.0 | 79.808 |
| 1642.0 | 79.728 |
| 1643.0 | 79.961 |
| 1644.0 | 80.329 |
| 1645.0 | 80.569 |
| 1646.0 | 80.603 |
| 1647.0 | 80.437 |
| 1648.0 | 80.186 |
| 1649.0 | 80.071 |
| 1650.0 | 80.025 |
| 1651.0 | 79.992 |
| 1652.0 | 80.156 |
| 1653.0 | 80.452 |
| 1654.0 | 80.619 |
| 1655.0 | 80.594 |
| 1656.0 | 80.382 |
| 1657.0 | 80.114 |
| 1658.0 | 79.989 |
| 1659.0 | 79.975 |
| 1660.0 | 80.055 |
| 1661.0 | 80.115 |
| 1662.0 | 80.07 |
| 1663.0 | 79.998 |
| 1664.0 | 79.915 |
| 1665.0 | 79.877 |
| 1666.0 | 80.003 |
| 1667.0 | 80.227 |
| 1668.0 | 80.341 |
| 1669.0 | 80.39 |
| 1670.0 | 80.497 |
| 1671.0 | 80.464 |
| 1672.0 | 80.293 |
| 1673.0 | 80.093 |
| 1674.0 | 79.923 |
| 1675.0 | 79.944 |
| 1676.0 | 80.075 |
| 1677.0 | 80.228 |
| 1678.0 | 80.447 |
| 1679.0 | 80.703 |
| 1680.0 | 80.909 |
| 1681.0 | 80.916 |
| 1682.0 | 80.756 |
| 1683.0 | 80.597 |
| 1684.0 | 80.503 |
| 1685.0 | 80.444 |
| 1686.0 | 80.376 |
| 1687.0 | 80.267 |
| 1688.0 | 80.116 |
| 1689.0 | 79.981 |
| 1690.0 | 80.08 |
| 1691.0 | 80.192 |
| 1692.0 | 80.213 |
| 1693.0 | 80.253 |
| 1694.0 | 80.281 |
| 1695.0 | 80.294 |
| 1696.0 | 80.292 |
| 1697.0 | 80.223 |
| 1698.0 | 80.023 |
| 1699.0 | 79.792 |
| 1700.0 | 79.799 |
| 1701.0 | 80.077 |
| 1702.0 | 80.262 |
| 1703.0 | 80.32 |
| 1704.0 | 80.303 |
| 1705.0 | 80.252 |
| 1706.0 | 80.261 |
| 1707.0 | 80.3 |
| 1708.0 | 80.262 |
| 1709.0 | 80.042 |
| 1710.0 | 79.918 |
| 1711.0 | 79.921 |
| 1712.0 | 79.901 |
| 1713.0 | 79.884 |
| 1714.0 | 80.078 |
| 1715.0 | 80.39 |
| 1716.0 | 80.665 |
| 1717.0 | 80.73 |
| 1718.0 | 80.697 |
| 1719.0 | 80.58 |
| 1720.0 | 80.313 |
| 1721.0 | 80.122 |
| 1722.0 | 80.031 |
| 1723.0 | 80.015 |
| 1724.0 | 79.969 |
| 1725.0 | 79.855 |
| 1726.0 | 79.761 |
| 1727.0 | 79.803 |
| 1728.0 | 79.95 |
| 1729.0 | 80.163 |
| 1730.0 | 80.443 |
| 1731.0 | 80.767 |
| 1732.0 | 81.009 |
| 1733.0 | 80.899 |
| 1734.0 | 80.566 |
| 1735.0 | 80.241 |
| 1736.0 | 80.161 |
| 1737.0 | 80.152 |
| 1738.0 | 80.106 |
| 1739.0 | 80.043 |
| 1740.0 | 80.03 |
| 1741.0 | 79.976 |
| 1742.0 | 79.829 |
| 1743.0 | 79.771 |
| 1744.0 | 79.929 |
| 1745.0 | 80.107 |
| 1746.0 | 80.197 |
| 1747.0 | 80.254 |
| 1748.0 | 80.249 |
| 1749.0 | 80.186 |
| 1750.0 | 80.143 |
| 1751.0 | 80.097 |
| 1752.0 | 80.048 |
| 1753.0 | 80.061 |
| 1754.0 | 80.144 |
| 1755.0 | 80.168 |
| 1756.0 | 80.118 |
| 1757.0 | 80.09 |
| 1758.0 | 80.027 |
| 1759.0 | 79.917 |
| 1760.0 | 79.894 |
| 1761.0 | 80.07 |
| 1762.0 | 80.265 |
| 1763.0 | 80.319 |
| 1764.0 | 80.333 |
| 1765.0 | 80.348 |
| 1766.0 | 80.31 |
| 1767.0 | 80.315 |
| 1768.0 | 80.331 |
| 1769.0 | 80.387 |
| 1770.0 | 80.425 |
| 1771.0 | 80.366 |
| 1772.0 | 80.267 |
| 1773.0 | 80.119 |
| 1774.0 | 79.942 |
| 1775.0 | 79.979 |
| 1776.0 | 80.255 |
| 1777.0 | 80.596 |
| 1778.0 | 80.792 |
| 1779.0 | 80.821 |
| 1780.0 | 80.752 |
| 1781.0 | 80.75 |
| 1782.0 | 80.888 |
| 1783.0 | 81.035 |
| 1784.0 | 80.944 |
| 1785.0 | 80.734 |
| 1786.0 | 80.565 |
| 1787.0 | 80.415 |
| 1788.0 | 80.156 |
| 1789.0 | 79.972 |
| 1790.0 | 80.08 |
| 1791.0 | 80.288 |
| 1792.0 | 80.488 |
| 1793.0 | 80.795 |
| 1794.0 | 80.886 |
| 1795.0 | 80.804 |
| 1796.0 | 80.744 |
| 1797.0 | 80.886 |
| 1798.0 | 81.075 |
| 1799.0 | 81.158 |
| 1800.0 | 81.157 |
| 1801.0 | 80.975 |
| 1802.0 | 80.805 |
| 1803.0 | 80.844 |
| 1804.0 | 80.895 |
| 1805.0 | 80.862 |
| 1806.0 | 80.759 |
| 1807.0 | 80.711 |
| 1808.0 | 80.62 |
| 1809.0 | 80.376 |
| 1810.0 | 80.186 |
| 1811.0 | 80.362 |
| 1812.0 | 80.512 |
| 1813.0 | 80.738 |
| 1814.0 | 80.983 |
| 1815.0 | 81.271 |
| 1816.0 | 81.254 |
| 1817.0 | 80.938 |
| 1818.0 | 80.476 |
| 1819.0 | 80.002 |
| 1820.0 | 80.151 |
| 1821.0 | 80.564 |
| 1822.0 | 80.862 |
| 1823.0 | 81.079 |
| 1824.0 | 81.101 |
| 1825.0 | 81.124 |
| 1826.0 | 81.152 |
| 1827.0 | 81.101 |
| 1828.0 | 81.114 |
| 1829.0 | 81.097 |
| 1830.0 | 81.082 |
| 1831.0 | 81.339 |
| 1832.0 | 81.169 |
| 1833.0 | 80.729 |
| 1834.0 | 80.149 |
| 1835.0 | 80.093 |
| 1836.0 | 80.58 |
| 1837.0 | 81.08 |
| 1838.0 | 81.147 |
| 1839.0 | 80.669 |
| 1840.0 | 80.274 |
| 1841.0 | 80.384 |
| 1842.0 | 80.885 |
| 1843.0 | 81.413 |
| 1844.0 | 81.308 |
| 1845.0 | 80.456 |
| 1846.0 | 80.003 |
| 1847.0 | 80.592 |
| 1848.0 | 81.435 |
| 1849.0 | 81.636 |
| 1850.0 | 81.13 |
| 1851.0 | 80.91 |
| 1852.0 | 80.899 |
| 1853.0 | 81.174 |
| 1854.0 | 81.21 |
| 1855.0 | 80.999 |
| 1856.0 | 80.949 |
| 1857.0 | 81.234 |
| 1858.0 | 81.472 |
| 1859.0 | 81.383 |
| 1860.0 | 81.21 |
| 1861.0 | 80.791 |
| 1862.0 | 80.342 |
| 1863.0 | 80.473 |
| 1864.0 | 81.33 |
| 1865.0 | 82.047 |
| 1866.0 | 81.618 |
| 1867.0 | 80.81 |
| 1868.0 | 80.396 |
| 1869.0 | 80.31 |
| 1870.0 | 80.472 |
| 1871.0 | 80.682 |
| 1872.0 | 80.721 |
| 1873.0 | 80.754 |
| 1874.0 | 80.712 |
| 1875.0 | 80.719 |
| 1876.0 | 81.01 |
| 1877.0 | 81.376 |
| 1878.0 | 81.74 |
| 1879.0 | 81.628 |
| 1880.0 | 81.515 |
| 1881.0 | 81.331 |
| 1882.0 | 81.065 |
| 1883.0 | 80.921 |
| 1884.0 | 80.926 |
| 1885.0 | 81.076 |
| 1886.0 | 81.303 |
| 1887.0 | 81.366 |
| 1888.0 | 81.535 |
| 1889.0 | 81.461 |
| 1890.0 | 81.244 |
| 1891.0 | 81.156 |
| 1892.0 | 81.314 |
| 1893.0 | 81.72 |
| 1894.0 | 82.016 |
| 1895.0 | 81.969 |
| 1896.0 | 81.442 |
| 1897.0 | 80.579 |
| 1898.0 | 80.055 |
| 1899.0 | 79.995 |
| 1900.0 | 80.603 |
| 1901.0 | 81.157 |
| 1902.0 | 81.272 |
| 1903.0 | 80.949 |
| 1904.0 | 80.621 |
| 1905.0 | 80.524 |
| 1906.0 | 80.779 |
| 1907.0 | 81.064 |
| 1908.0 | 81.405 |
| 1909.0 | 81.687 |
| 1910.0 | 81.594 |
| 1911.0 | 81.162 |
| 1912.0 | 80.739 |
| 1913.0 | 80.563 |
| 1914.0 | 80.679 |
| 1915.0 | 81.089 |
| 1916.0 | 81.642 |
| 1917.0 | 81.784 |
| 1918.0 | 81.51 |
| 1919.0 | 80.92 |
| 1920.0 | 80.574 |
| 1921.0 | 80.556 |
| 1922.0 | 80.701 |
| 1923.0 | 80.923 |
| 1924.0 | 81.042 |
| 1925.0 | 80.905 |
| 1926.0 | 80.769 |
| 1927.0 | 80.58 |
| 1928.0 | 80.353 |
| 1929.0 | 80.406 |
| 1930.0 | 80.746 |
| 1931.0 | 81.031 |
| 1932.0 | 81.118 |
| 1933.0 | 80.902 |
| 1934.0 | 80.713 |
| 1935.0 | 80.648 |
| 1936.0 | 80.878 |
| 1937.0 | 81.168 |
| 1938.0 | 81.425 |
| 1939.0 | 81.725 |
| 1940.0 | 81.813 |
| 1941.0 | 81.864 |
| 1942.0 | 81.936 |
| 1943.0 | 81.877 |
| 1944.0 | 81.778 |
| 1945.0 | 81.641 |
| 1946.0 | 81.487 |
| 1947.0 | 81.549 |
| 1948.0 | 81.645 |
| 1949.0 | 81.673 |
| 1950.0 | 81.606 |
| 1951.0 | 81.614 |
| 1952.0 | 81.618 |
| 1953.0 | 81.548 |
| 1954.0 | 81.616 |
| 1955.0 | 81.776 |
| 1956.0 | 81.862 |
| 1957.0 | 81.803 |
| 1958.0 | 81.59 |
| 1959.0 | 81.706 |
| 1960.0 | 81.795 |
| 1961.0 | 81.759 |
| 1962.0 | 81.834 |
| 1963.0 | 81.821 |
| 1964.0 | 81.742 |
| 1965.0 | 81.952 |
| 1966.0 | 82.148 |
| 1967.0 | 82.277 |
| 1968.0 | 82.259 |
| 1969.0 | 82.119 |
| 1970.0 | 81.785 |
| 1971.0 | 81.755 |
| 1972.0 | 82.037 |
| 1973.0 | 82.188 |
| 1974.0 | 82.244 |
| 1975.0 | 82.363 |
| 1976.0 | 82.554 |
| 1977.0 | 82.787 |
| 1978.0 | 82.758 |
| 1979.0 | 82.654 |
| 1980.0 | 82.587 |
| 1981.0 | 82.391 |
| 1982.0 | 82.242 |
| 1983.0 | 82.118 |
| 1984.0 | 81.792 |
| 1985.0 | 81.45 |
| 1986.0 | 81.253 |
| 1987.0 | 81.207 |
| 1988.0 | 81.295 |
| 1989.0 | 81.567 |
| 1990.0 | 81.723 |
| 1991.0 | 81.679 |
| 1992.0 | 81.618 |
| 1993.0 | 81.519 |
| 1994.0 | 80.997 |
| 1995.0 | 80.997 |
| 1996.0 | 80.997 |
| 1997.0 | 80.997 |
| 1998.0 | 80.997 |
| 1999.0 | 80.997 |
| 2000.065834 | 81.045 |
| 2009.942668 | 81.185 |
| 2020.098566 | 81.38 |
| 2029.969298 | 81.576 |
| 2039.837 | 81.792 |
| 2049.98346 | 81.972 |
| 2059.844971 | 82.196 |
| 2069.985031 | 82.273 |
| 2079.840289 | 82.36 |
| 2089.973887 | 82.512 |
| 2099.822832 | 82.568 |
| 2109.949906 | 82.564 |
| 2119.792477 | 82.659 |
| 2129.912964 | 82.729 |
| 2140.030088 | 82.771 |
| 2149.862941 | 82.87 |
| 2159.973384 | 82.94 |
| 2169.799712 | 83.058 |
| 2179.903413 | 83.166 |
| 2190.003671 | 83.212 |
| 2199.820052 | 83.233 |
| 2209.913475 | 83.365 |
| 2219.723179 | 83.417 |
| 2229.809704 | 83.495 |
| 2239.892708 | 83.559 |
| 2249.692237 | 83.648 |
| 2259.76825 | 83.696 |
| 2269.840694 | 83.728 |
| 2279.909553 | 83.768 |
| 2289.695271 | 83.815 |
| 2299.757015 | 83.859 |
| 2309.815127 | 83.871 |
| 2319.869592 | 83.954 |
| 2329.641254 | 83.971 |
| 2339.688478 | 84.018 |
| 2349.732008 | 84.059 |
| 2359.771828 | 84.033 |
| 2369.80792 | 83.922 |
| 2379.840271 | 83.971 |
| 2389.590342 | 83.974 |
| 2399.615266 | 83.902 |
| 2409.6364 | 83.92 |
| 2419.65373 | 84.047 |
| 2429.667238 | 83.987 |
| 2439.676909 | 83.992 |
| 2449.682728 | 83.987 |
| 2459.684679 | 83.922 |
| 2469.682745 | 83.833 |
| 2479.676911 | 83.924 |
| 2489.667162 | 83.906 |
| 2499.653481 | 83.893 |
| 2509.635853 | 83.963 |
| 2519.614261 | 84.148 |
| 2529.588691 | 84.077 |
| 2539.559127 | 83.967 |
| 2549.525552 | 83.987 |
| 2559.487951 | 83.857 |
| 2569.722871 | 83.699 |
| 2579.677058 | 83.689 |
| 2589.627171 | 83.68 |
| 2599.573195 | 83.718 |
| 2609.515113 | 83.827 |
| 2619.452911 | 83.86 |
| 2629.662448 | 83.605 |
| 2639.591842 | 83.456 |
| 2649.517067 | 82.966 |
| 2659.438109 | 82.215 |
| 2669.630358 | 80.676 |
| 2679.542867 | 78.161 |
| 2689.451145 | 74.559 |
| 2699.630227 | 70.029 |
| 2709.529877 | 64.853 |
| 2719.425248 | 59.458 |
| 2729.591015 | 54.681 |
| 2739.477662 | 50.729 |
| 2749.359982 | 47.593 |
| 2759.512287 | 45.164 |
| 2769.385788 | 43.563 |
| 2779.528995 | 42.635 |
| 2789.393611 | 41.904 |
| 2799.527654 | 41.498 |
| 2809.383323 | 41.331 |
| 2819.508136 | 41.333 |
| 2829.354792 | 41.42 |
| 2839.47031 | 41.739 |
| 2849.30789 | 42.068 |
| 2859.414046 | 42.388 |
| 2869.515434 | 42.85 |
| 2879.339216 | 43.296 |
| 2889.431143 | 43.689 |
| 2899.24569 | 44.101 |
| 2909.328092 | 44.623 |
| 2919.40564 | 45.187 |
| 2929.206149 | 45.743 |
| 2939.274073 | 46.31 |
| 2949.337095 | 46.959 |
| 2959.395197 | 47.498 |
| 2969.17672 | 47.953 |
| 2979.225066 | 48.348 |
| 2989.268442 | 48.737 |
| 2999.306833 | 49.19 |
| 3009.34022 | 49.676 |
| 3019.368587 | 50.173 |
| 3029.391918 | 50.736 |
| 3039.139497 | 51.3 |
| 3049.152842 | 51.852 |
| 3059.1611 | 52.38 |
| 3069.164256 | 52.873 |
| 3079.162292 | 53.393 |
| 3089.155191 | 53.836 |
| 3099.142938 | 54.332 |
| 3109.125515 | 54.859 |
| 3119.102905 | 55.404 |
| 3129.075093 | 55.979 |
| 3139.311366 | 56.56 |
| 3149.272956 | 56.948 |
| 3159.229293 | 57.463 |
| 3169.18036 | 57.82 |
| 3179.126141 | 58.173 |
| 3189.066618 | 58.568 |
| 3199.27022 | 58.992 |
| 3209.199897 | 59.314 |
| 3219.124221 | 59.74 |
| 3229.043176 | 59.902 |
| 3239.224603 | 60.041 |
| 3249.132622 | 60.176 |
| 3259.035221 | 60.095 |
| 3269.199799 | 59.918 |
| 3279.091361 | 59.803 |
| 3288.977454 | 59.473 |
| 3299.125027 | 59.074 |
| 3308.999981 | 58.668 |
| 3319.136081 | 58.09 |
| 3328.999829 | 57.302 |
| 3339.124385 | 56.431 |
| 3348.976861 | 55.41 |
| 3359.089804 | 54.151 |
| 3368.930939 | 52.902 |
| 3379.0322 | 51.404 |
| 3389.127517 | 49.889 |
| 3398.951437 | 48.163 |
| 3409.034967 | 46.518 |
| 3419.112499 | 44.821 |
| 3428.919052 | 43.248 |
| 3438.984693 | 41.501 |
| 3449.044284 | 39.872 |
| 3458.833318 | 38.174 |
| 3468.880914 | 36.415 |
| 3478.922407 | 34.749 |
| 3488.957779 | 33.253 |
| 3498.987012 | 31.734 |
| 3509.010089 | 30.416 |
| 3519.026992 | 29.209 |
| 3529.037703 | 28.033 |
| 3538.779008 | 26.821 |
| 3548.777448 | 25.882 |
| 3558.769643 | 24.885 |
| 3568.755577 | 24.045 |
| 3578.997769 | 23.214 |
| 3588.970961 | 22.573 |
| 3598.937838 | 22.056 |
| 3608.898383 | 21.793 |
| 3618.852578 | 21.629 |
| 3628.800407 | 21.702 |
| 3638.74185 | 22.021 |
| 3648.938253 | 22.355 |
| 3658.866705 | 22.975 |
| 3668.788719 | 23.752 |
| 3678.704279 | 24.709 |
| 3688.874043 | 25.76 |
| 3698.776469 | 26.841 |
| 3708.672387 | 27.838 |
| 3718.821938 | 29.002 |
| 3728.704616 | 30.122 |
| 3738.840542 | 31.255 |
| 3748.709907 | 32.3 |
| 3758.832135 | 33.457 |
| 3768.688117 | 34.122 |
| 3778.796573 | 34.883 |
| 3788.639101 | 35.534 |
| 3798.733711 | 35.985 |
| 3808.821282 | 36.161 |
| 3818.643407 | 36.421 |
| 3828.717023 | 36.273 |
| 3838.783543 | 35.937 |
| 3848.585104 | 35.477 |
| 3858.637559 | 35.01 |
| 3868.682864 | 34.472 |
| 3878.720999 | 33.872 |
| 3888.751945 | 32.971 |
| 3898.518755 | 32.407 |
| 3908.535455 | 31.733 |
| 3918.54491 | 31.012 |
| 3928.547104 | 30.262 |
| 3938.542016 | 29.747 |
| 3948.52963 | 29.201 |
| 3958.509925 | 28.591 |
| 3968.482884 | 28.052 |
| 3978.70392 | 27.817 |
| 3988.661962 | 27.748 |
| 3998.612612 | 27.63 |
| 4008.555852 | 27.471 |
| 4018.491662 | 27.569 |
| 4028.6745 | 27.609 |
| 4038.595205 | 27.709 |
| 4048.508426 | 27.781 |
| 4058.414143 | 28.282 |
| 4068.56604 | 28.479 |
| 4078.456503 | 28.759 |
| 4088.592715 | 28.883 |
| 4098.467848 | 29.14 |
| 4108.588299 | 29.292 |
| 4118.448027 | 29.282 |
| 4128.552639 | 29.316 |
| 4138.396887 | 29.463 |
| 4148.485584 | 29.417 |
| 4158.566193 | 29.113 |
| 4168.386981 | 29.378 |
| 4178.45156 | 28.503 |
| 4188.507992 | 28.1 |
| 4198.305151 | 27.929 |
| 4208.345437 | 27.478 |
| 4218.377519 | 26.403 |
| 4228.401377 | 26.747 |
| 4238.416991 | 26.409 |
| 4248.424343 | 25.083 |
| 4258.423411 | 24.282 |
| 4268.414178 | 23.662 |
| 4278.396623 | 22.851 |
| 4288.370728 | 22.135 |
| 4298.336471 | 22.135 |
| 4308.293836 | 21.872 |
| 4318.2428 | 21.66 |
| 4328.431752 | 20.949 |
| 4338.363649 | 20.131 |
| 4348.287088 | 19.285 |
| 4358.20205 | 18.293 |
| 4368.356068 | 17.483 |
| 4378.253805 | 16.786 |
| 4388.390126 | 16.184 |
| 4398.270558 | 15.478 |
| 4408.389101 | 15.025 |
| 4418.252149 | 14.25 |
| 4428.352834 | 13.639 |
| 4438.198419 | 12.943 |
| 4448.281165 | 12.482 |
| 4458.354799 | 11.82 |
| 4468.173935 | 11.307 |
| 4478.229508 | 10.537 |
| 4488.275909 | 9.886 |
| 4498.313117 | 9.278 |
| 4508.096635 | 8.773 |
| 4518.115621 | 8.191 |
| 4528.125352 | 7.926 |
| 4538.125809 | 7.518 |
| 4548.11697 | 7.083 |
| 4558.098816 | 6.661 |
| 4568.071325 | 6.355 |
| 4578.277365 | 5.911 |
| 4588.230912 | 5.614 |
| 4598.175061 | 5.219 |
| 4608.109792 | 4.845 |
| 4618.035085 | 4.7 |
| 4628.192649 | 4.519 |
| 4638.098772 | 4.349 |
| 4647.995395 | 4.181 |
| 4658.123528 | 4.046 |
| 4668.000857 | 3.913 |
| 4678.109183 | 3.803 |
| 4687.967136 | 3.71 |
| 4698.05557 | 3.627 |
| 4708.133906 | 3.525 |
| 4717.962521 | 3.433 |
| 4728.020838 | 3.344 |
| 4738.068993 | 3.244 |
| 4748.106964 | 3.149 |
| 4758.13473 | 3.074 |
| 4767.913874 | 3 |
| 4777.921408 | 2.927 |
| 4787.918673 | 2.866 |
| 4797.905646 | 2.806 |
| 4807.882307 | 2.745 |
| 4818.085802 | 2.681 |
| 4828.041526 | 2.618 |
| 4837.986874 | 2.556 |
| 4847.921823 | 2.499 |
| 4857.846351 | 2.441 |
| 4867.996361 | 2.39 |
| 4877.899737 | 2.341 |
| 4888.028045 | 2.295 |
| 4897.910179 | 2.25 |
| 4908.016697 | 2.206 |
| 4917.877504 | 2.165 |
| 4927.962141 | 2.124 |
| 4937.801534 | 2.081 |
| 4947.864203 | 2.035 |
| 4957.915724 | 1.992 |
| 4967.956075 | 1.947 |
| 4977.985234 | 1.905 |
| 4987.77033 | 1.866 |
| 4997.777298 | 1.831 |
| 5007.776688 | 1.796 |
| 5017.595804 | 1.766 |
| 5028.169082 | 1.735 |
| 5037.98605 | 1.705 |
| 5047.80198 | 1.673 |
| 5057.616872 | 1.642 |
| 5068.18559 | 1.61 |
| 5077.998316 | 1.58 |
| 5087.809996 | 1.548 |
| 5097.620628 | 1.519 |
| 5107.430211 | 1.49 |
| 5117.993201 | 1.462 |
| 5127.800597 | 1.434 |
| 5137.606938 | 1.409 |
| 5147.41222 | 1.384 |
| 5157.970569 | 1.362 |
| 5167.773648 | 1.34 |
| 5177.575662 | 1.32 |
| 5187.376611 | 1.303 |
| 5197.930283 | 1.289 |
| 5207.729011 | 1.273 |
| 5217.526666 | 1.26 |
| 5227.323247 | 1.246 |
| 5237.872207 | 1.23 |
| 5247.666549 | 1.213 |
| 5257.459812 | 1.197 |
| 5268.005191 | 1.18 |
| 5277.796202 | 1.163 |
| 5287.586127 | 1.147 |
| 5297.374963 | 1.132 |
| 5307.915566 | 1.118 |
| 5317.702134 | 1.102 |
| 5327.487607 | 1.088 |
| 5337.271982 | 1.073 |
| 5347.807773 | 1.059 |
| 5357.589864 | 1.046 |
| 5367.370852 | 1.033 |
| 5377.902987 | 1.021 |
| 5387.681677 | 1.011 |
| 5397.459258 | 1.001 |
| 5407.235727 | 0.99 |
| 5417.762987 | 0.98 |
| 5427.537141 | 0.97 |
| 5437.310177 | 0.961 |
| 5447.833734 | 0.952 |
| 5457.604442 | 0.943 |
| 5467.374028 | 0.934 |
| 5477.142487 | 0.924 |
| 5487.661104 | 0.913 |
| 5497.427219 | 0.903 |
| 5507.192201 | 0.895 |
| 5517.707068 | 0.887 |
| 5527.469693 | 0.878 |
| 5537.231179 | 0.869 |
| 5547.742274 | 0.86 |
| 5557.50139 | 0.854 |
| 5567.259362 | 0.848 |
| 5577.766665 | 0.841 |
| 5587.522253 | 0.835 |
| 5597.276691 | 0.829 |
| 5607.780182 | 0.821 |
| 5617.532223 | 0.813 |
| 5627.283108 | 0.806 |
| 5637.032835 | 0.798 |
| 5647.531242 | 0.791 |
| 5657.278555 | 0.785 |
| 5667.024703 | 0.781 |
| 5677.51925 | 0.78 |
| 5687.262972 | 0.778 |
| 5697.005523 | 0.774 |
| 5707.496189 | 0.77 |
| 5717.236302 | 0.764 |
| 5726.975237 | 0.759 |
| 5737.462002 | 0.754 |
| 5747.198485 | 0.749 |
| 5757.682605 | 0.743 |
| 5767.416629 | 0.738 |
| 5777.149464 | 0.732 |
| 5787.629649 | 0.728 |
| 5797.360012 | 0.723 |
| 5807.08918 | 0.72 |
| 5817.565409 | 0.716 |
| 5827.292092 | 0.712 |
| 5837.017575 | 0.707 |
| 5847.489828 | 0.703 |
| 5857.212813 | 0.699 |
| 5866.934591 | 0.693 |
| 5877.402847 | 0.688 |
| 5887.122114 | 0.683 |
| 5897.587661 | 0.68 |
| 5907.304408 | 0.677 |
| 5917.019938 | 0.672 |
| 5927.481454 | 0.667 |
| 5937.194452 | 0.664 |
| 5946.906226 | 0.663 |
| 5957.363691 | 0.662 |
| 5967.072921 | 0.66 |
| 5977.52764 | 0.657 |
| 5987.234315 | 0.653 |
| 5996.939757 | 0.649 |
| 6007.39039 | 0.646 |
| 6017.093265 | 0.645 |
| 6026.794901 | 0.644 |
| 6037.241429 | 0.639 |
| 6046.940485 | 0.635 |
| 6057.38423 | 0.632 |
| 6067.080698 | 0.629 |
| 6076.775917 | 0.626 |
| 6087.215522 | 0.622 |
| 6096.908139 | 0.619 |
| 6107.344938 | 0.616 |
| 6117.034946 | 0.614 |
| 6126.723694 | 0.612 |
| 6137.156319 | 0.609 |
| 6146.842444 | 0.606 |
| 6157.272241 | 0.602 |
| 6166.955735 | 0.599 |
| 6177.382693 | 0.596 |
| 6187.063548 | 0.593 |
| 6196.743128 | 0.592 |
| 6207.165865 | 0.59 |
| 6216.842793 | 0.588 |
| 6227.262668 | 0.586 |
| 6236.936935 | 0.585 |
| 6246.609918 | 0.584 |
| 6257.025537 | 0.583 |
| 6266.695846 | 0.581 |
| 6277.108582 | 0.578 |
| 6286.776208 | 0.575 |
| 6297.18605 | 0.573 |
| 6306.850986 | 0.57 |
| 6317.257926 | 0.567 |
| 6326.920162 | 0.564 |
| 6336.581095 | 0.561 |
| 6346.983717 | 0.558 |
| 6356.641938 | 0.555 |
| 6367.041635 | 0.554 |
| 6376.697135 | 0.554 |
| 6387.093897 | 0.555 |
| 6396.746668 | 0.556 |
| 6407.140486 | 0.556 |
| 6416.790518 | 0.555 |
| 6427.181383 | 0.552 |
| 6436.828669 | 0.55 |
| 6446.47463 | 0.548 |
| 6456.861103 | 0.546 |
| 6466.504304 | 0.544 |
| 6476.8878 | 0.541 |
| 6486.528234 | 0.539 |
| 6496.908745 | 0.536 |
| 6506.546402 | 0.534 |
| 6516.923919 | 0.534 |
| 6526.558791 | 0.533 |
| 6536.933304 | 0.532 |
| 6546.565382 | 0.532 |
| 6556.936882 | 0.531 |
| 6566.566159 | 0.529 |
| 6576.934637 | 0.527 |
| 6586.561102 | 0.526 |
| 6596.926549 | 0.524 |
| 6606.550195 | 0.521 |
| 6616.912601 | 0.519 |
| 6626.53342 | 0.516 |
| 6636.892776 | 0.515 |
| 6646.510758 | 0.513 |
| 6656.867055 | 0.511 |
| 6666.482193 | 0.509 |
| 6676.835422 | 0.507 |
| 6686.447706 | 0.506 |
| 6696.797857 | 0.505 |
| 6706.40728 | 0.505 |
| 6716.754344 | 0.505 |
| 6726.360896 | 0.503 |
| 6736.704865 | 0.501 |
| 6746.308538 | 0.499 |
| 6756.649402 | 0.497 |
| 6766.250188 | 0.495 |
| 6776.587937 | 0.494 |
| 6786.924068 | 0.492 |
| 6796.520453 | 0.49 |
| 6806.853456 | 0.489 |
| 6816.446931 | 0.488 |
| 6826.776797 | 0.488 |
| 6836.367355 | 0.488 |
| 6846.694074 | 0.488 |
| 6856.281707 | 0.488 |
| 6866.60527 | 0.488 |
| 6876.189968 | 0.487 |
| 6886.510366 | 0.486 |
| 6896.82912 | 0.484 |
| 6906.409345 | 0.482 |
| 6916.724921 | 0.481 |
| 6926.30219 | 0.48 |
| 6936.614577 | 0.478 |
| 6946.188882 | 0.477 |
| 6956.498072 | 0.475 |
| 6966.805601 | 0.473 |
| 6976.375388 | 0.471 |
| 6986.679706 | 0.47 |
| 6996.246507 | 0.469 |
| 7006.547605 | 0.468 |
| 7016.111412 | 0.467 |
| 7026.40928 | 0.465 |
| 7036.70547 | 0.464 |
| 7046.264714 | 0.462 |
| 7056.557661 | 0.461 |
| 7066.113889 | 0.46 |
| 7076.403584 | 0.459 |
| 7086.691589 | 0.458 |
| 7096.243221 | 0.456 |
| 7106.527959 | 0.455 |
| 7116.076554 | 0.454 |
| 7126.358018 | 0.453 |
| 7136.637779 | 0.452 |
| 7146.181746 | 0.45 |
| 7156.458218 | 0.449 |
| 7165.999126 | 0.448 |
| 7176.2723 | 0.446 |
| 7186.54376 | 0.444 |
| 7196.080008 | 0.443 |
| 7206.348156 | 0.441 |
| 7216.614582 | 0.44 |
| 7226.14615 | 0.439 |
| 7236.409251 | 0.438 |
| 7245.937725 | 0.437 |
| 7256.197491 | 0.436 |
| 7266.455524 | 0.435 |
| 7275.979286 | 0.434 |
| 7286.23397 | 0.432 |
| 7296.486914 | 0.432 |
| 7306.005944 | 0.431 |
| 7316.255525 | 0.431 |
| 7326.503358 | 0.43 |
| 7336.017637 | 0.429 |
| 7346.262094 | 0.429 |
| 7356.504797 | 0.427 |
| 7366.014304 | 0.426 |
| 7376.253616 | 0.425 |
| 7386.491167 | 0.424 |
| 7395.995884 | 0.423 |
| 7406.23003 | 0.422 |
| 7416.462408 | 0.421 |
| 7425.962315 | 0.42 |
| 7436.191274 | 0.42 |
| 7446.418458 | 0.419 |
| 7455.913536 | 0.418 |
| 7466.137287 | 0.417 |
| 7476.359256 | 0.417 |
| 7485.849485 | 0.417 |
| 7496.068008 | 0.417 |
| 7506.284741 | 0.416 |
| 7515.770101 | 0.415 |
| 7525.983375 | 0.414 |
| 7536.19485 | 0.413 |
| 7545.675324 | 0.412 |
| 7555.883326 | 0.41 |
| 7566.089524 | 0.409 |
| 7576.293916 | 0.408 |
| 7585.767802 | 0.407 |
| 7595.968701 | 0.406 |
| 7606.167786 | 0.406 |
| 7615.636739 | 0.405 |
| 7625.832319 | 0.405 |
| 7636.026078 | 0.404 |
| 7646.218013 | 0.403 |
| 7655.680318 | 0.402 |
| 7665.868729 | 0.401 |
| 7676.05531 | 0.4 |
| 7686.240057 | 0.398 |
| 7695.695679 | 0.398 |
| 7705.876884 | 0.397 |
| 7716.056248 | 0.396 |
| 7726.23377 | 0.395 |
| 7735.682674 | 0.393 |
| 7745.856636 | 0.393 |
| 7756.028747 | 0.392 |
| 7766.199006 | 0.392 |
| 7775.641157 | 0.392 |
| 7785.807837 | 0.391 |
| 7795.972657 | 0.39 |
| 7806.135616 | 0.388 |
| 7815.57098 | 0.387 |
| 7825.730341 | 0.386 |
| 7835.887833 | 0.386 |
| 7846.043454 | 0.385 |
| 7855.471995 | 0.384 |
| 7865.624 | 0.383 |
| 7875.774127 | 0.382 |
| 7885.922372 | 0.381 |
| 7896.068734 | 0.38 |
| 7905.488668 | 0.379 |
| 7915.631391 | 0.379 |
| 7925.772224 | 0.378 |
| 7935.911164 | 0.377 |
| 7946.048209 | 0.376 |
| 7955.45948 | 0.376 |
| 7965.592863 | 0.375 |
| 7975.724343 | 0.375 |
| 7985.853919 | 0.374 |
| 7995.981587 | 0.373 |
| 8005.384141 | 0.373 |
| 8015.508125 | 0.372 |
| 8025.630194 | 0.372 |
| 8035.750346 | 0.371 |
| 8045.86858 | 0.371 |
| 8055.984892 | 0.371 |
| 8065.376887 | 0.37 |
| 8075.489487 | 0.369 |
| 8085.600158 | 0.368 |
| 8095.708897 | 0.368 |
| 8105.815704 | 0.367 |
| 8115.920574 | 0.366 |
| 8125.301933 | 0.365 |
| 8135.403063 | 0.364 |
| 8145.502251 | 0.363 |
| 8155.599493 | 0.362 |
| 8165.694787 | 0.362 |
| 8175.788131 | 0.361 |
| 8185.879523 | 0.361 |
| 8195.248351 | 0.36 |
| 8205.33597 | 0.359 |
| 8215.42163 | 0.359 |
| 8225.505327 | 0.358 |
| 8235.587061 | 0.358 |
| 8245.666827 | 0.358 |
| 8255.744624 | 0.358 |
| 8265.82045 | 0.357 |
| 8275.174806 | 0.356 |
| 8285.246822 | 0.355 |
| 8295.31686 | 0.354 |
| 8305.384917 | 0.354 |
| 8315.45099 | 0.353 |
| 8325.515077 | 0.353 |
| 8335.577176 | 0.352 |
| 8345.637284 | 0.351 |
| 8355.695399 | 0.35 |
| 8365.751519 | 0.35 |
| 8375.087555 | 0.35 |
| 8385.139819 | 0.349 |
| 8395.190081 | 0.348 |
| 8405.238338 | 0.348 |
| 8415.284587 | 0.347 |
| 8425.328827 | 0.346 |
| 8435.371055 | 0.345 |
| 8445.411268 | 0.344 |
| 8455.449464 | 0.343 |
| 8465.485641 | 0.343 |
| 8475.519796 | 0.343 |
| 8485.551927 | 0.342 |
| 8495.582031 | 0.343 |
| 8505.610107 | 0.343 |
| 8515.636151 | 0.343 |
| 8525.660162 | 0.343 |
| 8535.682136 | 0.343 |
| 8544.98643 | 0.342 |
| 8555.004471 | 0.342 |
| 8565.020468 | 0.342 |
| 8575.034421 | 0.341 |
| 8585.046325 | 0.34 |
| 8595.056179 | 0.339 |
| 8605.063981 | 0.338 |
| 8615.069727 | 0.338 |
| 8625.073416 | 0.337 |
| 8635.075045 | 0.337 |
| 8645.074612 | 0.336 |
| 8655.072114 | 0.335 |
| 8665.067549 | 0.335 |
| 8675.060915 | 0.334 |
| 8685.052209 | 0.334 |
| 8695.041429 | 0.333 |
| 8705.028573 | 0.332 |
| 8715.013637 | 0.332 |
| 8724.99662 | 0.332 |
| 8734.977519 | 0.332 |
| 8744.956333 | 0.331 |
| 8754.933058 | 0.331 |
| 8764.907692 | 0.33 |
| 8774.880232 | 0.329 |
| 8784.850677 | 0.329 |
| 8794.819025 | 0.329 |
| 8804.785271 | 0.328 |
| 8815.461059 | 0.328 |
| 8825.422948 | 0.327 |
| 8835.382728 | 0.327 |
| 8845.340399 | 0.326 |
| 8855.295957 | 0.325 |
| 8865.249401 | 0.325 |
| 8875.200727 | 0.325 |
| 8885.149933 | 0.324 |
| 8895.097018 | 0.323 |
| 8905.041978 | 0.323 |
| 8914.984812 | 0.322 |
| 8924.925517 | 0.321 |
| 8934.86409 | 0.321 |
| 8944.800529 | 0.32 |
| 8954.734832 | 0.32 |
| 8965.376355 | 0.319 |
| 8975.306225 | 0.319 |
| 8985.233952 | 0.318 |
| 8995.159534 | 0.318 |
| 9005.082967 | 0.317 |
| 9015.004249 | 0.317 |
| 9024.923378 | 0.316 |
| 9034.840353 | 0.316 |
| 9044.755169 | 0.315 |
| 9054.667825 | 0.315 |
| 9065.286129 | 0.315 |
| 9075.194303 | 0.315 |
| 9085.10031 | 0.316 |
| 9095.004147 | 0.316 |
| 9104.905813 | 0.316 |
| 9114.805303 | 0.316 |
| 9124.702617 | 0.316 |
| 9134.597752 | 0.316 |
| 9145.197262 | 0.316 |
| 9155.087875 | 0.316 |
| 9164.976302 | 0.316 |
| 9174.86254 | 0.316 |
| 9184.746587 | 0.315 |
| 9194.628441 | 0.315 |
| 9204.508098 | 0.314 |
| 9215.091006 | 0.314 |
| 9224.966108 | 0.314 |
| 9234.839006 | 0.313 |
| 9244.709699 | 0.313 |
| 9254.578185 | 0.313 |
| 9265.149109 | 0.312 |
| 9275.013013 | 0.312 |
| 9284.874702 | 0.312 |
| 9294.734174 | 0.312 |
| 9304.591426 | 0.312 |
| 9314.446456 | 0.312 |
| 9325.002949 | 0.311 |
| 9334.853368 | 0.311 |
| 9344.701558 | 0.311 |
| 9354.547517 | 0.311 |
| 9364.391241 | 0.31 |
| 9374.935607 | 0.31 |
| 9384.774696 | 0.309 |
| 9394.611544 | 0.309 |
| 9404.446148 | 0.309 |
| 9414.980732 | 0.309 |
| 9424.810682 | 0.308 |
| 9434.63838 | 0.308 |
| 9444.463825 | 0.307 |
| 9454.988585 | 0.307 |
| 9464.809356 | 0.306 |
| 9474.627866 | 0.306 |
| 9484.444114 | 0.306 |
| 9494.959008 | 0.305 |
| 9504.770561 | 0.305 |
| 9514.579844 | 0.305 |
| 9524.386855 | 0.304 |
| 9534.891842 | 0.305 |
| 9544.694139 | 0.305 |
| 9554.494156 | 0.305 |
| 9564.291891 | 0.305 |
| 9574.786929 | 0.305 |
| 9584.57993 | 0.304 |
| 9594.370643 | 0.304 |
| 9604.858149 | 0.304 |
| 9614.644112 | 0.304 |
| 9624.427779 | 0.304 |
| 9634.209147 | 0.304 |
| 9644.686632 | 0.304 |
| 9654.463232 | 0.303 |
| 9664.237526 | 0.303 |
| 9674.707423 | 0.302 |
| 9684.476934 | 0.302 |
| 9694.244132 | 0.302 |
| 9704.706417 | 0.301 |
| 9714.468817 | 0.301 |
| 9724.228897 | 0.301 |
| 9734.683548 | 0.3 |
| 9744.438814 | 0.3 |
| 9754.191753 | 0.299 |
| 9764.638746 | 0.3 |
| 9774.386857 | 0.299 |
| 9784.132634 | 0.299 |
| 9794.571945 | 0.298 |
| 9804.312879 | 0.298 |
| 9814.746996 | 0.298 |
| 9824.483078 | 0.298 |
| 9834.216813 | 0.298 |
| 9844.643209 | 0.298 |
| 9854.372076 | 0.297 |
| 9864.09859 | 0.297 |
| 9874.517241 | 0.296 |
| 9884.238873 | 0.296 |
| 9894.652288 | 0.295 |
| 9904.369027 | 0.295 |
| 9914.083402 | 0.295 |
| 9924.489032 | 0.294 |
| 9934.198499 | 0.294 |
| 9944.598867 | 0.295 |
| 9954.303417 | 0.295 |
| 9964.00559 | 0.295 |
| 9974.398135 | 0.295 |
| 9984.095376 | 0.295 |
| 9994.482631 | 0.294 |
| 10004.17493 | 0.294 |
| 10014.55689 | 0.294 |
| 10024.24423 | 0.293 |
| 10033.92919 | 0.293 |
| 10044.30326 | 0.293 |
| 10053.98325 | 0.293 |
| 10064.352 | 0.292 |
| 10074.02701 | 0.292 |
| 10084.39043 | 0.292 |
| 10094.06045 | 0.291 |
| 10104.41852 | 0.291 |
| 10114.08355 | 0.291 |
| 10124.43625 | 0.291 |
| 10134.09628 | 0.29 |
| 10144.44362 | 0.29 |
| 10154.09862 | 0.289 |
| 10164.44058 | 0.289 |
| 10174.09056 | 0.289 |
| 10184.42713 | 0.288 |
| 10194.07208 | 0.288 |
| 10204.40325 | 0.288 |
| 10214.04315 | 0.287 |
| 10224.36891 | 0.287 |
| 10234.00375 | 0.287 |
| 10244.32409 | 0.287 |
| 10253.95386 | 0.287 |
| 10264.26877 | 0.286 |
| 10273.89347 | 0.287 |
| 10284.20293 | 0.287 |
| 10293.82255 | 0.287 |
| 10304.12656 | 0.287 |
| 10313.74108 | 0.287 |
| 10324.03963 | 0.287 |
| 10334.33534 | 0.287 |
| 10343.94211 | 0.287 |
| 10354.23234 | 0.286 |
| 10363.834 | 0.286 |
| 10374.11874 | 0.286 |
| 10383.71527 | 0.286 |
| 10393.99451 | 0.285 |
| 10404.2709 | 0.285 |
| 10413.85962 | 0.284 |
| 10424.1305 | 0.284 |
| 10433.71407 | 0.284 |
| 10443.97941 | 0.283 |
| 10454.2419 | 0.283 |
| 10463.81763 | 0.282 |
| 10474.07457 | 0.283 |
| 10483.64512 | 0.283 |
| 10493.8965 | 0.283 |
| 10504.14501 | 0.282 |
| 10513.70769 | 0.282 |
| 10523.95063 | 0.282 |
| 10534.19068 | 0.281 |
| 10543.74545 | 0.281 |
| 10553.97992 | 0.281 |
| 10564.21149 | 0.281 |
| 10573.75835 | 0.28 |
| 10583.98432 | 0.28 |
| 10593.52594 | 0.28 |
| 10603.7463 | 0.279 |
| 10613.96375 | 0.279 |
| 10624.17829 | 0.278 |
| 10633.70924 | 0.278 |
| 10643.91815 | 0.278 |
| 10654.12414 | 0.277 |
| 10663.64709 | 0.277 |
| 10673.84743 | 0.277 |
| 10684.04485 | 0.276 |
| 10693.55979 | 0.276 |
| 10703.75154 | 0.276 |
| 10713.94035 | 0.275 |
| 10723.44726 | 0.275 |
| 10733.6304 | 0.274 |
| 10743.81059 | 0.274 |
| 10753.98783 | 0.274 |
| 10763.48393 | 0.274 |
| 10773.65548 | 0.273 |
| 10783.82407 | 0.273 |
| 10793.9897 | 0.273 |
| 10803.47495 | 0.273 |
| 10813.63486 | 0.272 |
| 10823.7918 | 0.272 |
| 10833.94578 | 0.272 |
| 10843.42014 | 0.272 |
| 10853.56838 | 0.271 |
| 10863.71363 | 0.271 |
| 10873.85591 | 0.271 |
| 10883.31935 | 0.271 |
| 10893.45586 | 0.27 |
| 10903.58938 | 0.27 |
| 10913.71992 | 0.27 |
| 10923.84746 | 0.27 |
| 10933.29714 | 0.27 |
| 10943.41889 | 0.27 |
| 10953.53764 | 0.27 |
| 10963.65339 | 0.27 |
| 10973.76613 | 0.269 |
| 10983.87586 | 0.269 |
| 10993.3089 | 0.27 |
| 11003.41281 | 0.27 |
| 11013.5137 | 0.27 |
| 11023.61157 | 0.27 |
| 11033.70642 | 0.27 |
| 11043.79825 | 0.27 |
| 11053.21456 | 0.27 |
| 11063.30053 | 0.27 |
| 11073.38346 | 0.269 |
| 11083.46337 | 0.269 |
| 11093.54023 | 0.269 |
| 11103.61405 | 0.268 |
| 11113.68483 | 0.268 |
| 11123.75256 | 0.268 |
| 11133.14635 | 0.268 |
| 11143.20819 | 0.268 |
| 11153.26696 | 0.268 |
| 11163.32268 | 0.268 |
| 11173.37534 | 0.268 |
| 11183.42494 | 0.267 |
| 11193.47147 | 0.267 |
| 11203.51493 | 0.268 |
| 11213.55532 | 0.268 |
| 11223.59263 | 0.268 |
| 11233.62687 | 0.268 |
| 11243.65803 | 0.267 |
| 11253.6861 | 0.267 |
| 11263.71109 | 0.267 |
| 11273.06496 | 0.267 |
| 11283.08398 | 0.267 |
| 11293.09991 | 0.267 |
| 11303.11274 | 0.266 |
| 11313.12247 | 0.266 |
| 11323.12909 | 0.266 |
| 11333.13262 | 0.265 |
| 11343.13303 | 0.265 |
| 11353.13034 | 0.265 |
| 11363.12453 | 0.264 |
| 11373.11561 | 0.264 |
| 11383.10358 | 0.265 |
| 11393.08842 | 0.265 |
| 11403.07013 | 0.265 |
| 11413.04872 | 0.265 |
| 11423.02418 | 0.265 |
| 11432.99651 | 0.265 |
| 11442.96571 | 0.264 |
| 11452.93177 | 0.264 |
| 11463.55877 | 0.264 |
| 11473.51834 | 0.264 |
| 11483.47476 | 0.264 |
| 11493.42803 | 0.264 |
| 11503.37815 | 0.263 |
| 11513.32512 | 0.264 |
| 11523.26893 | 0.264 |
| 11533.20958 | 0.264 |
| 11543.14707 | 0.264 |
| 11553.0814 | 0.263 |
| 11563.01256 | 0.263 |
| 11572.94055 | 0.263 |
| 11582.86536 | 0.263 |
| 11593.44833 | 0.262 |
| 11603.36658 | 0.262 |
| 11613.28165 | 0.262 |
| 11623.19353 | 0.262 |
| 11633.10223 | 0.262 |
| 11643.00774 | 0.263 |
| 11652.91006 | 0.263 |
| 11662.80918 | 0.263 |
| 11673.36472 | 0.263 |
| 11683.25723 | 0.263 |
| 11693.14654 | 0.263 |
| 11703.03264 | 0.263 |
| 11712.91554 | 0.262 |
| 11722.79522 | 0.262 |
| 11733.33001 | 0.262 |
| 11743.20304 | 0.261 |
| 11753.07286 | 0.261 |
| 11762.93946 | 0.261 |
| 11772.80283 | 0.261 |
| 11783.3202 | 0.26 |
| 11793.1769 | 0.26 |
| 11803.03036 | 0.26 |
| 11812.88059 | 0.26 |
| 11822.72758 | 0.26 |
| 11833.22747 | 0.259 |
| 11843.06776 | 0.259 |
| 11852.9048 | 0.259 |
| 11862.73859 | 0.259 |
| 11873.22439 | 0.259 |
| 11883.05145 | 0.259 |
| 11892.87526 | 0.259 |
| 11902.69581 | 0.259 |
| 11913.16747 | 0.259 |
| 11922.98127 | 0.259 |
| 11932.79181 | 0.259 |
| 11942.59907 | 0.258 |
| 11953.05654 | 0.259 |
| 11962.85704 | 0.259 |
| 11972.65425 | 0.259 |
| 11983.10099 | 0.259 |
| 11992.89142 | 0.26 |
| 12002.67856 | 0.26 |
| 12013.11455 | 0.26 |
| 12022.89488 | 0.261 |
| 12032.67192 | 0.261 |
| 12043.09713 | 0.26 |
| 12052.86735 | 0.26 |
| 12062.63426 | 0.26 |
| 12073.04866 | 0.259 |
| 12082.80874 | 0.259 |
| 12092.5655 | 0.259 |
| 12102.96906 | 0.259 |
| 12112.71897 | 0.259 |
| 12122.46556 | 0.259 |
| 12132.85826 | 0.26 |
| 12142.59798 | 0.26 |
| 12152.98334 | 0.26 |
| 12162.71618 | 0.26 |
| 12172.44568 | 0.261 |
| 12182.82013 | 0.26 |
| 12192.54273 | 0.261 |
| 12202.90982 | 0.26 |
| 12212.62551 | 0.26 |
| 12222.98523 | 0.26 |
| 12232.69399 | 0.26 |
| 12242.39941 | 0.26 |
| 12252.74815 | 0.259 |
| 12262.44662 | 0.259 |
| 12272.78796 | 0.259 |
| 12282.47948 | 0.259 |
| 12292.81339 | 0.26 |
| 12302.49796 | 0.26 |
| 12312.82444 | 0.26 |
| 12322.50203 | 0.259 |
| 12332.82106 | 0.259 |
| 12342.49167 | 0.259 |
| 12352.80325 | 0.259 |
| 12362.46686 | 0.258 |
| 12372.77097 | 0.258 |
| 12382.42757 | 0.258 |
| 12392.7242 | 0.259 |
| 12402.37378 | 0.259 |
| 12412.66292 | 0.258 |
| 12422.30547 | 0.258 |
| 12432.58711 | 0.258 |
| 12442.22262 | 0.258 |
| 12452.49673 | 0.258 |
| 12462.76697 | 0.257 |
| 12472.39178 | 0.257 |
| 12482.65448 | 0.257 |
| 12492.27222 | 0.257 |
| 12502.52738 | 0.257 |
| 12512.77863 | 0.257 |
| 12522.38563 | 0.257 |
| 12532.62932 | 0.257 |
| 12542.22922 | 0.257 |
| 12552.46533 | 0.256 |
| 12562.69753 | 0.256 |
| 12572.28665 | 0.256 |
| 12582.51125 | 0.257 |
| 12592.73192 | 0.256 |
| 12602.31024 | 0.256 |
| 12612.5233 | 0.256 |
| 12622.09447 | 0.256 |
| 12632.29991 | 0.256 |
| 12642.5014 | 0.256 |
| 12652.69895 | 0.256 |
| 12662.25557 | 0.256 |
| 12672.44547 | 0.255 |
| 12682.63142 | 0.255 |
| 12692.17715 | 0.255 |
| 12702.35544 | 0.255 |
| 12712.52975 | 0.255 |
| 12722.06458 | 0.255 |
| 12732.23121 | 0.255 |
| 12742.39387 | 0.255 |
| 12752.55256 | 0.255 |
| 12762.07271 | 0.255 |
| 12772.22369 | 0.255 |
| 12782.37068 | 0.254 |
| 12792.51369 | 0.254 |
| 12802.01913 | 0.254 |
| 12812.1544 | 0.254 |
| 12822.28568 | 0.254 |
| 12832.41295 | 0.254 |
| 12842.53622 | 0.254 |
| 12852.02315 | 0.254 |
| 12862.13866 | 0.254 |
| 12872.25016 | 0.254 |
| 12882.35764 | 0.254 |
| 12892.4611 | 0.255 |
| 12901.92944 | 0.255 |
| 12912.02511 | 0.256 |
| 12922.11675 | 0.257 |
| 12932.20436 | 0.257 |
| 12942.28794 | 0.257 |
| 12952.36747 | 0.257 |
| 12962.44297 | 0.257 |
| 12971.88508 | 0.257 |
| 12981.95274 | 0.257 |
| 12992.01635 | 0.257 |
| 13002.07591 | 0.256 |
| 13012.13141 | 0.256 |
| 13022.18286 | 0.256 |
| 13032.23024 | 0.256 |
| 13042.27356 | 0.256 |
| 13052.31281 | 0.256 |
| 13062.34799 | 0.256 |
| 13072.37909 | 0.256 |
| 13081.77955 | 0.256 |
| 13091.80275 | 0.256 |
| 13101.82186 | 0.256 |
| 13111.83689 | 0.256 |
| 13121.84783 | 0.256 |
| 13131.85468 | 0.256 |
| 13141.85743 | 0.256 |
| 13151.85608 | 0.255 |
| 13161.85063 | 0.256 |
| 13171.84107 | 0.255 |
| 13181.8274 | 0.255 |
| 13191.80963 | 0.255 |
| 13201.78774 | 0.255 |
| 13211.76172 | 0.255 |
| 13221.73159 | 0.255 |
| 13231.69734 | 0.255 |
| 13241.65895 | 0.255 |
| 13252.23865 | 0.255 |
| 13262.19174 | 0.254 |
| 13272.1407 | 0.254 |
| 13282.08552 | 0.254 |
| 13292.02619 | 0.255 |
| 13301.96272 | 0.255 |
| 13311.8951 | 0.255 |
| 13321.82333 | 0.256 |
| 13331.7474 | 0.256 |
| 13341.66731 | 0.256 |
| 13351.58306 | 0.256 |
| 13362.11398 | 0.257 |
| 13372.02114 | 0.257 |
| 13381.92413 | 0.257 |
| 13391.82294 | 0.257 |
| 13401.71758 | 0.256 |
| 13411.60803 | 0.256 |
| 13422.11206 | 0.256 |
| 13431.99388 | 0.256 |
| 13441.87151 | 0.256 |
| 13451.74495 | 0.256 |
| 13461.6142 | 0.256 |
| 13472.09567 | 0.256 |
| 13481.95625 | 0.255 |
| 13491.81263 | 0.255 |
| 13501.66479 | 0.255 |
| 13511.51275 | 0.255 |
| 13521.97158 | 0.255 |
| 13531.81084 | 0.255 |
| 13541.64588 | 0.256 |
| 13551.47669 | 0.256 |
| 13561.9173 | 0.256 |
| 13571.7394 | 0.255 |
| 13581.55725 | 0.256 |
| 13591.98409 | 0.255 |
| 13601.79321 | 0.255 |
| 13611.59808 | 0.255 |
| 13621.39871 | 0.255 |
| 13631.80722 | 0.256 |
| 13641.59909 | 0.256 |
| 13651.38669 | 0.257 |
| 13661.78136 | 0.258 |
| 13671.56018 | 0.258 |
| 13681.94551 | 0.258 |
| 13691.71553 | 0.257 |
| 13701.48128 | 0.257 |
| 13711.85271 | 0.257 |
| 13721.60964 | 0.257 |
| 13731.3623 | 0.257 |
| 13741.7198 | 0.257 |
| 13751.46361 | 0.257 |
| 13761.81172 | 0.257 |
| 13771.54668 | 0.257 |
| 13781.88538 | 0.257 |
| 13791.61148 | 0.258 |
| 13801.33328 | 0.258 |
| 13811.65798 | 0.258 |
| 13821.37089 | 0.258 |
| 13831.68615 | 0.259 |
| 13841.39017 | 0.258 |
| 13851.69596 | 0.258 |
| 13861.39108 | 0.258 |
| 13871.6874 | 0.258 |
| 13881.37359 | 0.258 |
| 13891.66043 | 0.259 |
| 13901.33769 | 0.259 |
| 13911.61502 | 0.259 |
| 13921.28334 | 0.259 |
| 13931.55116 | 0.259 |
| 13941.21051 | 0.259 |
| 13951.46881 | 0.259 |
| 13961.72219 | 0.259 |
| 13971.36795 | 0.259 |
| 13981.61179 | 0.258 |
| 13991.24855 | 0.258 |
| 14001.48283 | 0.258 |
| 14011.71217 | 0.258 |
| 14021.33529 | 0.258 |
| 14031.55505 | 0.258 |
| 14041.16914 | 0.259 |
| 14051.37931 | 0.259 |
| 14061.58453 | 0.259 |
| 14071.18493 | 0.259 |
| 14081.38053 | 0.259 |
| 14091.57118 | 0.259 |
| 14101.15785 | 0.259 |
| 14111.33886 | 0.259 |
| 14121.51491 | 0.259 |
| 14131.08782 | 0.259 |
| 14141.25421 | 0.259 |
| 14151.41561 | 0.259 |
| 14161.57204 | 0.259 |
| 14171.12647 | 0.259 |
| 14181.27321 | 0.259 |
| 14191.41496 | 0.259 |
| 14201.55171 | 0.259 |
| 14211.08762 | 0.259 |
| 14221.21466 | 0.259 |
| 14231.33669 | 0.259 |
| 14241.45371 | 0.258 |
| 14250.97103 | 0.258 |
| 14261.07831 | 0.258 |
| 14271.18057 | 0.258 |
| 14281.27781 | 0.258 |
| 14291.37001 | 0.258 |
| 14301.45718 | 0.258 |
| 14310.94639 | 0.258 |
| 14321.02379 | 0.258 |
| 14331.09614 | 0.258 |
| 14341.16344 | 0.258 |
| 14351.2257 | 0.258 |
| 14361.2829 | 0.258 |
| 14371.33504 | 0.258 |
| 14381.38213 | 0.258 |
| 14391.42415 | 0.258 |
| 14400.87083 | 0.258 |
| 14410.90301 | 0.258 |
| 14420.93011 | 0.258 |
| 14430.95214 | 0.258 |
| 14440.96908 | 0.258 |
| 14450.98094 | 0.258 |
| 14460.98771 | 0.258 |
| 14470.98939 | 0.258 |
| 14480.98597 | 0.258 |
| 14490.97745 | 0.258 |
| 14500.96383 | 0.258 |
| 14510.9451 | 0.259 |
| 14520.92127 | 0.26 |
| 14530.89232 | 0.26 |
| 14540.85825 | 0.261 |
| 14550.81906 | 0.261 |
| 14560.77475 | 0.261 |
| 14571.31048 | 0.262 |
| 14581.25561 | 0.262 |
| 14591.19561 | 0.263 |
| 14601.13046 | 0.263 |
| 14611.06018 | 0.262 |
| 14620.98475 | 0.263 |
| 14630.90417 | 0.263 |
| 14640.81844 | 0.264 |
| 14650.72755 | 0.264 |
| 14661.21393 | 0.263 |
| 14671.11242 | 0.263 |
| 14681.00574 | 0.263 |
| 14690.89389 | 0.263 |
| 14700.77687 | 0.264 |
| 14710.65467 | 0.264 |
| 14721.10787 | 0.264 |
| 14730.975 | 0.263 |
| 14740.83695 | 0.263 |
| 14750.6937 | 0.264 |
| 14761.12461 | 0.266 |
| 14770.97066 | 0.268 |
| 14780.81152 | 0.27 |
| 14790.64717 | 0.272 |
| 14801.05571 | 0.273 |
| 14810.88064 | 0.273 |
| 14820.70034 | 0.274 |
| 14831.09199 | 0.274 |
| 14840.90095 | 0.274 |
| 14850.70469 | 0.274 |
| 14861.07941 | 0.274 |
| 14870.87237 | 0.275 |
| 14880.6601 | 0.275 |
| 14891.01786 | 0.275 |
| 14900.7948 | 0.275 |
| 14910.56649 | 0.275 |
| 14920.90726 | 0.275 |
| 14930.66813 | 0.275 |
| 14940.99744 | 0.275 |
| 14950.74749 | 0.277 |
| 14960.49227 | 0.277 |
| 14970.80453 | 0.278 |
| 14980.53846 | 0.278 |
| 14990.83922 | 0.278 |
| 15000.56229 | 0.278 |
| 15010.85154 | 0.279 |
| 15020.56373 | 0.28 |
| 15030.84146 | 0.281 |
| 15040.54275 | 0.281 |
| 15050.80894 | 0.281 |
| 15060.49932 | 0.281 |
| 15070.75395 | 0.282 |
| 15080.43342 | 0.282 |
| 15090.67647 | 0.282 |
| 15100.91357 | 0.283 |
| 15110.57647 | 0.283 |
| 15120.80197 | 0.284 |
| 15130.45391 | 0.284 |
| 15140.6678 | 0.285 |
| 15150.87571 | 0.285 |
| 15160.51103 | 0.285 |
| 15170.70731 | 0.285 |
| 15180.33163 | 0.285 |
| 15190.51626 | 0.285 |
| 15200.69489 | 0.284 |
| 15210.30253 | 0.285 |
| 15220.4695 | 0.285 |
| 15230.63045 | 0.285 |
| 15240.78539 | 0.285 |
| 15250.37064 | 0.285 |
| 15260.51388 | 0.286 |
| 15270.65109 | 0.286 |
| 15280.78227 | 0.287 |
| 15290.34507 | 0.288 |
| 15300.46452 | 0.288 |
| 15310.57793 | 0.288 |
| 15320.6853 | 0.288 |
| 15330.22559 | 0.289 |
| 15340.32119 | 0.289 |
| 15350.41073 | 0.289 |
| 15360.49422 | 0.289 |
| 15370.57164 | 0.291 |
| 15380.64299 | 0.291 |
| 15390.70827 | 0.291 |
| 15400.20879 | 0.291 |
| 15410.26225 | 0.292 |
| 15420.30963 | 0.292 |
| 15430.35092 | 0.292 |
| 15440.38612 | 0.293 |
| 15450.41522 | 0.293 |
| 15460.43823 | 0.293 |
| 15470.45513 | 0.293 |
| 15480.46592 | 0.293 |
| 15490.4706 | 0.293 |
| 15500.46917 | 0.293 |
| 15510.46161 | 0.293 |
| 15520.44794 | 0.293 |
| 15530.42813 | 0.293 |
| 15540.4022 | 0.293 |
| 15550.37013 | 0.293 |
| 15560.33192 | 0.293 |
| 15570.28757 | 0.293 |
| 15580.23707 | 0.293 |
| 15590.18042 | 0.293 |
| 15600.11761 | 0.293 |
| 15610.04865 | 0.293 |
| 15620.52472 | 0.294 |
| 15630.44309 | 0.295 |
| 15640.35528 | 0.296 |
| 15650.2613 | 0.297 |
| 15660.16114 | 0.297 |
| 15670.0548 | 0.298 |
| 15680.4914 | 0.298 |
| 15690.37234 | 0.298 |
| 15700.24708 | 0.298 |
| 15710.11563 | 0.299 |
| 15719.97797 | 0.3 |
| 15730.38149 | 0.301 |
| 15740.23107 | 0.301 |
| 15750.07444 | 0.301 |
| 15759.91159 | 0.301 |
| 15770.2885 | 0.302 |
| 15780.11286 | 0.302 |
| 15789.93098 | 0.302 |
| 15800.2878 | 0.303 |
| 15810.09311 | 0.304 |
| 15819.89218 | 0.304 |
| 15830.22886 | 0.304 |
| 15840.01509 | 0.304 |
| 15850.33821 | 0.305 |
| 15860.11158 | 0.305 |
| 15869.87869 | 0.306 |
| 15880.18161 | 0.306 |
| 15889.93584 | 0.306 |
| 15900.22516 | 0.307 |
| 15909.96648 | 0.308 |
| 15920.24218 | 0.308 |
| 15929.97059 | 0.309 |
| 15940.23264 | 0.309 |
| 15949.94812 | 0.31 |
| 15960.19652 | 0.31 |
| 15969.89905 | 0.31 |
| 15980.13377 | 0.309 |
| 15989.82334 | 0.31 |
| 16000.04436 | 0.31 |